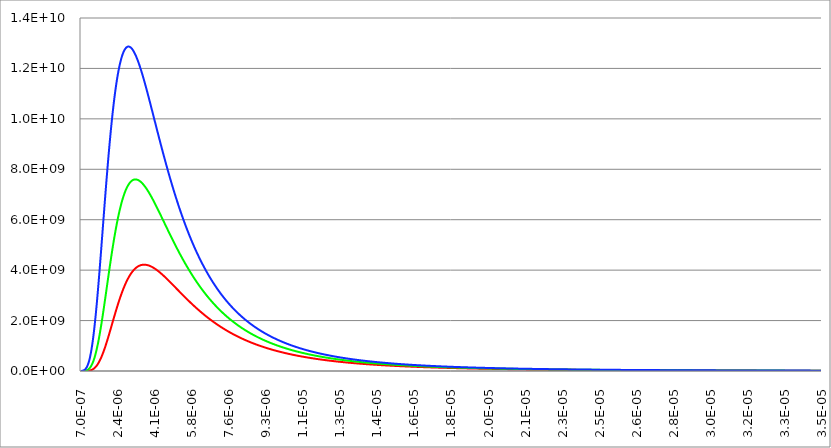
| Category | Series 1 | Series 0 | Series 2 |
|---|---|---|---|
| 7e-07 | 0 | 0 | 0 |
| 7.1715e-07 | 0 | 0 | 0 |
| 7.343e-07 | 0 | 0 | 0 |
| 7.5145e-07 | 63017.05 | 900243.841 | 7555823.94 |
| 7.686e-07 | 96024.858 | 1292754.587 | 10347180.398 |
| 7.8575e-07 | 143306.693 | 1822863.408 | 13942615.577 |
| 8.029e-07 | 209753.17 | 2526994.244 | 18506352.669 |
| 8.2005e-07 | 301481.452 | 3447872.196 | 24220528.497 |
| 8.372e-07 | 426017.487 | 4634884.951 | 31284426.29 |
| 8.5435e-07 | 592478.291 | 6144340.909 | 39913297.495 |
| 8.715e-07 | 811749.177 | 8039610.81 | 50336797.511 |
| 8.8865e-07 | 1096650.66 | 10391143.431 | 62797072.3 |
| 9.058e-07 | 1462089.82 | 13276349.92 | 77546542.491 |
| 9.2295e-07 | 1925191.194 | 16779355.419 | 94845438.836 |
| 9.401e-07 | 2505402.696 | 20990620.53 | 114959147.531 |
| 9.5725e-07 | 3224572.686 | 26006438.843 | 138155426.205 |
| 9.744e-07 | 4106995.03 | 31928319.904 | 164701551.366 |
| 9.9155e-07 | 5179419.822 | 38862269.762 | 194861456.194 |
| 1.0087e-06 | 6471028.296 | 46917983.332 | 228892914.036 |
| 1.02585e-06 | 8013371.355 | 56207964.396 | 267044818.077 |
| 1.043e-06 | 9840271.99 | 66846590.043 | 309554601.908 |
| 1.06015e-06 | 11987692.704 | 78949136.797 | 356645839.274 |
| 1.0773e-06 | 14493569.766 | 92630785.612 | 408526054.532 |
| 1.09445e-06 | 17397616.829 | 108005622.42 | 465384768.516 |
| 1.1116e-06 | 20741100.956 | 125185650.035 | 527391797.814 |
| 1.12875e-06 | 24566594.572 | 144279826.03 | 594695819.073 |
| 1.1459e-06 | 28917707.189 | 165393139.801 | 667423204.035 |
| 1.16305e-06 | 33838800.967 | 188625740.432 | 745677125.626 |
| 1.1802e-06 | 39374694.312 | 214072125.289 | 829536930.651 |
| 1.19735e-06 | 45570357.705 | 241820397.539 | 919057770.544 |
| 1.2145e-06 | 52470605.904 | 271951599.054 | 1014270478.177 |
| 1.23165e-06 | 60119790.506 | 304539123.463 | 1115181675.9 |
| 1.2488e-06 | 68561496.639 | 339648212.51 | 1221774097.835 |
| 1.26595e-06 | 77838247.287 | 377335537.381 | 1334007107.808 |
| 1.2831e-06 | 87991218.422 | 417648865.242 | 1451817393.254 |
| 1.30025e-06 | 99059967.814 | 460626810.057 | 1575119814.817 |
| 1.3174e-06 | 111082179.963 | 506298665.597 | 1703808391.199 |
| 1.33455e-06 | 124093429.281 | 554684317.638 | 1837757399.005 |
| 1.3517e-06 | 138126963.239 | 605794231.578 | 1976822567.811 |
| 1.36885e-06 | 153213506.835 | 659629511.006 | 2120842351.433 |
| 1.386e-06 | 169381089.379 | 716182022.288 | 2269639257.343 |
| 1.40315e-06 | 186654894.254 | 775434579.85 | 2423021217.244 |
| 1.4203e-06 | 205057131.971 | 837361186.577 | 2580782983.074 |
| 1.43745e-06 | 224606936.585 | 901927323.591 | 2742707533.966 |
| 1.4546e-06 | 245320285.215 | 969090283.64 | 2908567481.05 |
| 1.47175e-06 | 267209940.225 | 1038799542.339 | 3078126458.323 |
| 1.4889e-06 | 290285413.369 | 1110997161.638 | 3251140489.153 |
| 1.50605e-06 | 314552951.055 | 1185618220.018 | 3427359319.292 |
| 1.5232e-06 | 340015539.716 | 1262591264.186 | 3606527708.549 |
| 1.54035e-06 | 366672930.136 | 1341838777.256 | 3788386674.466 |
| 1.5575e-06 | 394521679.518 | 1423277658.72 | 3972674682.494 |
| 1.57465e-06 | 423555209.966 | 1506819711.821 | 4159128778.225 |
| 1.5918e-06 | 453763882.022 | 1592372134.258 | 4347485658.231 |
| 1.60895e-06 | 485135081.871 | 1679838008.526 | 4537482676.954 |
| 1.6261e-06 | 517653320.795 | 1769116788.489 | 4728858787.931 |
| 1.64325e-06 | 551300345.484 | 1860104779.182 | 4921355418.374 |
| 1.6604e-06 | 586055257.809 | 1952695607.116 | 5114717276.794 |
| 1.67755e-06 | 621894642.714 | 2046780678.735 | 5308693093.936 |
| 1.6947e-06 | 658792702.897 | 2142249624.968 | 5503036297.811 |
| 1.71185e-06 | 696721399.044 | 2238990730.105 | 5697505624.073 |
| 1.729e-06 | 735650594.392 | 2336891343.548 | 5891865663.331 |
| 1.74615e-06 | 775548202.484 | 2435838273.205 | 6085887347.342 |
| 1.7633e-06 | 816380337.061 | 2535718159.604 | 6279348376.276 |
| 1.78045e-06 | 858111463.073 | 2636417829.97 | 6472033589.461 |
| 1.7976e-06 | 900704547.891 | 2737824631.769 | 6663735282.17 |
| 1.81475e-06 | 944121211.869 | 2839826745.393 | 6854253471.166 |
| 1.8319e-06 | 988321877.472 | 2942313475.837 | 7043396111.764 |
| 1.84905e-06 | 1033265916.277 | 3045175523.375 | 7230979269.256 |
| 1.8662e-06 | 1078911793.205 | 3148305233.394 | 7416827247.556 |
| 1.88335e-06 | 1125217207.418 | 3251596825.646 | 7600772677.913 |
| 1.9005e-06 | 1172139229.406 | 3354946603.301 | 7782656570.516 |
| 1.91765e-06 | 1219634433.811 | 3458253142.279 | 7962328331.786 |
| 1.9348e-06 | 1267659027.641 | 3561417461.41 | 8139645750.062 |
| 1.95194999999999e-06 | 1316168973.544 | 3664343174.033 | 8314474952.337 |
| 1.96909999999999e-06 | 1365120107.914 | 3766936621.721 | 8486690334.597 |
| 1.98624999999999e-06 | 1414468253.593 | 3869106990.839 | 8656174468.241 |
| 2.00339999999999e-06 | 1464169327.052 | 3970766412.686 | 8822817984.926 |
| 2.02054999999999e-06 | 1514179439.908 | 4071830048.011 | 8986519442.115 |
| 2.03769999999999e-06 | 1564454994.727 | 4172216156.679 | 9147185171.462 |
| 2.05484999999999e-06 | 1614952775.069 | 4271846153.302 | 9304729112.069 |
| 2.07199999999999e-06 | 1665630029.789 | 4370644649.645 | 9459072630.534 |
| 2.08914999999999e-06 | 1716444551.611 | 4468539484.599 | 9610144329.606 |
| 2.10629999999999e-06 | 1767354750.045 | 4565461742.532 | 9757879847.118 |
| 2.12344999999999e-06 | 1818319718.723 | 4661345760.803 | 9902221646.805 |
| 2.14059999999999e-06 | 1869299297.27 | 4756129127.203 | 10043118802.459 |
| 2.15774999999999e-06 | 1920254127.815 | 4849752668.077 | 10180526776.798 |
| 2.17489999999999e-06 | 1971145706.302 | 4942160427.872 | 10314407196.307 |
| 2.19204999999999e-06 | 2021936428.737 | 5033299640.798 | 10444727623.222 |
| 2.20919999999999e-06 | 2072589632.551 | 5123120695.304 | 10571461325.711 |
| 2.22634999999999e-06 | 2123069633.24 | 5211577092.012 | 10694587047.252 |
| 2.24349999999999e-06 | 2173341756.473 | 5298625395.753 | 10814088776.072 |
| 2.26064999999999e-06 | 2223372365.853 | 5384225182.282 | 10929955515.475 |
| 2.27779999999999e-06 | 2273128886.519 | 5468338980.279 | 11042181055.774 |
| 2.29494999999999e-06 | 2322579824.794 | 5550932209.141 | 11150763748.496 |
| 2.31209999999999e-06 | 2371694784.061 | 5631973113.108 | 11255706283.427 |
| 2.32924999999999e-06 | 2420444477.078 | 5711432692.194 | 11357015469.03 |
| 2.34639999999999e-06 | 2468800734.916 | 5789284630.39 | 11454702016.688 |
| 2.36354999999999e-06 | 2516736512.723 | 5865505221.546 | 11548780329.178 |
| 2.38069999999999e-06 | 2564225892.499 | 5940073293.373 | 11639268293.71 |
| 2.39784999999999e-06 | 2611244083.072 | 6012970129.893 | 11726187079.849 |
| 2.41499999999999e-06 | 2657767417.465 | 6084179392.726 | 11809560942.55 |
| 2.43214999999999e-06 | 2703773347.825 | 6153687041.515 | 11889417030.529 |
| 2.44929999999999e-06 | 2749240438.093 | 6221481253.794 | 11965785200.138 |
| 2.46644999999999e-06 | 2794148354.593 | 6287552344.579 | 12038697834.871 |
| 2.48359999999999e-06 | 2838477854.684 | 6351892685.938 | 12108189670.607 |
| 2.50074999999999e-06 | 2882210773.658 | 6414496626.765 | 12174297626.669 |
| 2.51789999999999e-06 | 2925330010.021 | 6475360412.975 | 12237060642.72 |
| 2.53504999999999e-06 | 2967819509.303 | 6534482108.321 | 12296519521.54 |
| 2.55219999999999e-06 | 3009664246.55 | 6591861515.996 | 12352716777.666 |
| 2.56934999999999e-06 | 3050850207.617 | 6647500101.188 | 12405696491.875 |
| 2.58649999999999e-06 | 3091364369.398 | 6701400914.719 | 12455504171.46 |
| 2.60364999999999e-06 | 3131194679.116 | 6753568517.913 | 12502186616.266 |
| 2.62079999999999e-06 | 3170330032.779 | 6804008908.783 | 12545791790.373 |
| 2.63794999999999e-06 | 3208760252.923 | 6852729449.651 | 12586368699.386 |
| 2.65509999999999e-06 | 3246476065.735 | 6899738796.281 | 12623967273.201 |
| 2.67224999999999e-06 | 3283469077.662 | 6945046828.595 | 12658638254.158 |
| 2.68939999999999e-06 | 3319731751.586 | 6988664583.048 | 12690433090.466 |
| 2.70654999999999e-06 | 3355257382.668 | 7030604186.696 | 12719403834.776 |
| 2.72369999999999e-06 | 3390040073.918 | 7070878793.021 | 12745603047.778 |
| 2.74084999999999e-06 | 3424074711.592 | 7109502519.522 | 12769083706.689 |
| 2.75799999999999e-06 | 3457356940.465 | 7146490387.127 | 12789899118.498 |
| 2.77514999999999e-06 | 3489883139.058 | 7181858261.419 | 12808102837.828 |
| 2.79229999999999e-06 | 3521650394.869 | 7215622795.705 | 12823748589.279 |
| 2.80944999999999e-06 | 3552656479.677 | 7247801375.923 | 12836890194.104 |
| 2.82659999999999e-06 | 3582899824.957 | 7278412067.396 | 12847581501.08 |
| 2.84374999999999e-06 | 3612379497.46 | 7307473563.416 | 12855876321.431 |
| 2.86089999999999e-06 | 3641095175.004 | 7335005135.659 | 12861828367.657 |
| 2.87804999999999e-06 | 3669047122.508 | 7361026586.41 | 12865491196.132 |
| 2.89519999999999e-06 | 3696236168.31 | 7385558202.581 | 12866918153.32 |
| 2.91234999999999e-06 | 3722663680.803 | 7408620711.503 | 12866162325.493 |
| 2.92949999999999e-06 | 3748331545.41 | 7430235238.457 | 12863276491.778 |
| 2.94664999999999e-06 | 3773242141.937 | 7450423265.934 | 12858313080.434 |
| 2.96379999999999e-06 | 3797398322.317 | 7469206594.58 | 12851324128.206 |
| 2.98094999999999e-06 | 3820803388.764 | 7486607305.793 | 12842361242.623 |
| 2.99809999999999e-06 | 3843461072.37 | 7502647725.952 | 12831475567.129 |
| 3.01524999999999e-06 | 3865375512.144 | 7517350392.225 | 12818717748.907 |
| 3.03239999999999e-06 | 3886551234.513 | 7530738019.935 | 12804137909.285 |
| 3.04954999999999e-06 | 3906993133.299 | 7542833471.436 | 12787785616.601 |
| 3.06669999999999e-06 | 3926706450.177 | 7553659726.463 | 12769709861.406 |
| 3.08384999999999e-06 | 3945696755.622 | 7563239853.921 | 12749959033.911 |
| 3.10099999999999e-06 | 3963969930.359 | 7571596985.063 | 12728580903.547 |
| 3.11814999999999e-06 | 3981532147.301 | 7578754288.03 | 12705622600.556 |
| 3.13529999999999e-06 | 3998389854.001 | 7584734943.704 | 12681130599.492 |
| 3.15244999999999e-06 | 4014549755.603 | 7589562122.836 | 12655150704.539 |
| 3.16959999999999e-06 | 4030018798.297 | 7593258964.406 | 12627728036.569 |
| 3.18674999999999e-06 | 4044804153.281 | 7595848555.179 | 12598907021.815 |
| 3.20389999999999e-06 | 4058913201.219 | 7597353910.42 | 12568731382.1 |
| 3.22104999999999e-06 | 4072353517.203 | 7597797955.715 | 12537244126.525 |
| 3.23819999999999e-06 | 4085132856.205 | 7597203509.878 | 12504487544.533 |
| 3.25534999999999e-06 | 4097259139.021 | 7595593268.885 | 12470503200.275 |
| 3.27249999999999e-06 | 4108740438.695 | 7592989790.816 | 12435331928.201 |
| 3.28964999999999e-06 | 4119584967.429 | 7589415481.756 | 12399013829.8 |
| 3.30679999999999e-06 | 4129801063.956 | 7584892582.618 | 12361588271.425 |
| 3.32394999999999e-06 | 4139397181.381 | 7579443156.861 | 12323093883.14 |
| 3.34109999999999e-06 | 4148381875.479 | 7573089079.059 | 12283568558.504 |
| 3.35824999999999e-06 | 4156763793.439 | 7565852024.286 | 12243049455.266 |
| 3.37539999999999e-06 | 4164551663.049 | 7557753458.297 | 12201572996.88 |
| 3.39254999999999e-06 | 4171754282.312 | 7548814628.451 | 12159174874.803 |
| 3.40969999999999e-06 | 4178380509.486 | 7539056555.358 | 12115890051.516 |
| 3.42684999999999e-06 | 4184439253.532 | 7528500025.223 | 12071752764.221 |
| 3.44399999999999e-06 | 4189939464.972 | 7517165582.838 | 12026796529.165 |
| 3.46114999999999e-06 | 4194890127.133 | 7505073525.212 | 11981054146.538 |
| 3.47829999999999e-06 | 4199300247.785 | 7492243895.801 | 11934557705.916 |
| 3.49544999999999e-06 | 4203178851.144 | 7478696479.306 | 11887338592.189 |
| 3.51259999999999e-06 | 4206534970.245 | 7464450797.025 | 11839427491.955 |
| 3.52974999999999e-06 | 4209377639.668 | 7449526102.722 | 11790854400.318 |
| 3.54689999999999e-06 | 4211715888.612 | 7433941378.989 | 11741648628.081 |
| 3.56404999999999e-06 | 4213558734.3 | 7417715334.085 | 11691838809.281 |
| 3.58119999999999e-06 | 4214915175.71 | 7400866399.218 | 11641452909.035 |
| 3.59834999999999e-06 | 4215794187.628 | 7383412726.249 | 11590518231.683 |
| 3.61549999999999e-06 | 4216204714.998 | 7365372185.806 | 11539061429.179 |
| 3.63264999999999e-06 | 4216155667.574 | 7346762365.775 | 11487108509.712 |
| 3.64979999999999e-06 | 4215655914.861 | 7327600570.15 | 11434684846.539 |
| 3.66694999999999e-06 | 4214714281.327 | 7307903818.232 | 11381815186.986 |
| 3.68409999999999e-06 | 4213339541.892 | 7287688844.139 | 11328523661.617 |
| 3.70124999999999e-06 | 4211540417.671 | 7266972096.636 | 11274833793.535 |
| 3.71839999999999e-06 | 4209325571.967 | 7245769739.235 | 11220768507.79 |
| 3.73554999999999e-06 | 4206703606.516 | 7224097650.577 | 11166350140.898 |
| 3.75269999999999e-06 | 4203683057.951 | 7201971425.067 | 11111600450.428 |
| 3.76984999999999e-06 | 4200272394.501 | 7179406373.742 | 11056540624.651 |
| 3.78699999999999e-06 | 4196480012.907 | 7156417525.366 | 11001191292.24 |
| 3.80414999999999e-06 | 4192314235.54 | 7133019627.738 | 10945572531.995 |
| 3.82129999999999e-06 | 4187783307.728 | 7109227149.188 | 10889703882.592 |
| 3.83844999999999e-06 | 4182895395.269 | 7085054280.268 | 10833604352.326 |
| 3.85559999999999e-06 | 4177658582.138 | 7060514935.6 | 10777292428.858 |
| 3.87274999999999e-06 | 4172080868.365 | 7035622755.895 | 10720786088.933 |
| 3.88989999999999e-06 | 4166170168.087 | 7010391110.109 | 10664102808.076 |
| 3.90704999999999e-06 | 4159934307.765 | 6984833097.747 | 10607259570.244 |
| 3.92419999999999e-06 | 4153381024.563 | 6958961551.278 | 10550272877.428 |
| 3.94134999999999e-06 | 4146517964.864 | 6932789038.686 | 10493158759.209 |
| 3.95849999999999e-06 | 4139352682.95 | 6906327866.106 | 10435932782.235 |
| 3.97564999999999e-06 | 4131892639.804 | 6879590080.579 | 10378610059.637 |
| 3.99279999999999e-06 | 4124145202.054 | 6852587472.879 | 10321205260.366 |
| 4.00994999999999e-06 | 4116117641.041 | 6825331580.433 | 10263732618.44 |
| 4.02709999999999e-06 | 4107817132.006 | 6797833690.31 | 10206205942.109 |
| 4.04424999999999e-06 | 4099250753.392 | 6770104842.274 | 10148638622.921 |
| 4.0614e-06 | 4090425486.264 | 6742155831.903 | 10091043644.691 |
| 4.07855e-06 | 4081348213.823 | 6713997213.752 | 10033433592.365 |
| 4.0957e-06 | 4072025721.027 | 6685639304.572 | 9975820660.78 |
| 4.11284999999999e-06 | 4062464694.303 | 6657092186.56 | 9918216663.313 |
| 4.12999999999999e-06 | 4052671721.355 | 6628365710.651 | 9860633040.415 |
| 4.14714999999999e-06 | 4042653291.05 | 6599469499.835 | 9803080868.031 |
| 4.16429999999999e-06 | 4032415793.396 | 6570412952.501 | 9745570865.905 |
| 4.18144999999999e-06 | 4021965519.585 | 6541205245.801 | 9688113405.755 |
| 4.19859999999999e-06 | 4011308662.12 | 6511855339.025 | 9630718519.342 |
| 4.21574999999999e-06 | 4000451315.008 | 6482371976.993 | 9573395906.4 |
| 4.23289999999999e-06 | 3989399474.014 | 6452763693.45 | 9516154942.453 |
| 4.25004999999999e-06 | 3978159036.984 | 6423038814.465 | 9459004686.5 |
| 4.26719999999999e-06 | 3966735804.225 | 6393205461.828 | 9401953888.578 |
| 4.28434999999999e-06 | 3955135478.936 | 6363271556.451 | 9345010997.197 |
| 4.30149999999999e-06 | 3943363667.694 | 6333244821.75 | 9288184166.647 |
| 4.31864999999999e-06 | 3931425880.992 | 6303132787.029 | 9231481264.18 |
| 4.3358e-06 | 3919327533.817 | 6272942790.841 | 9174909877.064 |
| 4.35295e-06 | 3907073946.274 | 6242681984.347 | 9118477319.508 |
| 4.3701e-06 | 3894670344.253 | 6212357334.643 | 9062190639.463 |
| 4.38725e-06 | 3882121860.126 | 6181975628.081 | 9006056625.3 |
| 4.4044e-06 | 3869433533.486 | 6151543473.557 | 8950081812.352 |
| 4.42155e-06 | 3856610311.92 | 6121067305.785 | 8894272489.341 |
| 4.4387e-06 | 3843657051.802 | 6090553388.536 | 8838634704.679 |
| 4.45585e-06 | 3830578519.126 | 6060007817.864 | 8783174272.639 |
| 4.473e-06 | 3817379390.359 | 6029436525.287 | 8727896779.413 |
| 4.49015e-06 | 3804064253.318 | 5998845280.95 | 8672807589.042 |
| 4.5073e-06 | 3790637608.071 | 5968239696.753 | 8617911849.23 |
| 4.52445e-06 | 3777103867.854 | 5937625229.448 | 8563214497.032 |
| 4.5416e-06 | 3763467360.013 | 5907007183.699 | 8508720264.436 |
| 4.55875e-06 | 3749732326.958 | 5876390715.113 | 8454433683.818 |
| 4.5759e-06 | 3735902927.13 | 5845780833.231 | 8400359093.285 |
| 4.59305e-06 | 3721983235.986 | 5815182404.489 | 8346500641.909 |
| 4.6102e-06 | 3707977246.998 | 5784600155.136 | 8292862294.839 |
| 4.62735e-06 | 3693888872.649 | 5754038674.115 | 8239447838.312 |
| 4.6445e-06 | 3679721945.46 | 5723502415.917 | 8186260884.552 |
| 4.66165e-06 | 3665480219.001 | 5692995703.379 | 8133304876.556 |
| 4.6788e-06 | 3651167368.929 | 5662522730.459 | 8080583092.78 |
| 4.69595e-06 | 3636786994.018 | 5632087564.965 | 8028098651.719 |
| 4.7131e-06 | 3622342617.202 | 5601694151.245 | 7975854516.383 |
| 4.73025e-06 | 3607837686.612 | 5571346312.835 | 7923853498.671 |
| 4.7474e-06 | 3593275576.628 | 5541047755.077 | 7872098263.647 |
| 4.76455e-06 | 3578659588.919 | 5510802067.685 | 7820591333.721 |
| 4.7817e-06 | 3563992953.493 | 5480612727.28 | 7769335092.722 |
| 4.79885e-06 | 3549278829.745 | 5450483099.88 | 7718331789.893 |
| 4.816e-06 | 3534520307.499 | 5420416443.355 | 7667583543.778 |
| 4.83315000000001e-06 | 3519720408.054 | 5390415909.835 | 7617092346.025 |
| 4.85030000000001e-06 | 3504882085.225 | 5360484548.085 | 7566860065.099 |
| 4.86745000000001e-06 | 3490008226.379 | 5330625305.839 | 7516888449.905 |
| 4.88460000000001e-06 | 3475101653.47 | 5300841032.092 | 7467179133.324 |
| 4.90175000000001e-06 | 3460165124.071 | 5271134479.353 | 7417733635.666 |
| 4.91890000000001e-06 | 3445201332.394 | 5241508305.861 | 7368553368.038 |
| 4.93605000000001e-06 | 3430212910.31 | 5211965077.763 | 7319639635.631 |
| 4.95320000000001e-06 | 3415202428.366 | 5182507271.249 | 7270993640.929 |
| 4.97035000000001e-06 | 3400172396.786 | 5153137274.653 | 7222616486.83 |
| 4.98750000000001e-06 | 3385125266.472 | 5123857390.514 | 7174509179.708 |
| 5.00465000000001e-06 | 3370063429.998 | 5094669837.598 | 7126672632.378 |
| 5.02180000000001e-06 | 3354989222.592 | 5065576752.887 | 7079107667.005 |
| 5.03895000000001e-06 | 3339904923.116 | 5036580193.528 | 7031815017.93 |
| 5.05610000000001e-06 | 3324812755.028 | 5007682138.742 | 6984795334.43 |
| 5.07325000000001e-06 | 3309714887.346 | 4978884491.706 | 6938049183.404 |
| 5.09040000000001e-06 | 3294613435.599 | 4950189081.389 | 6891577051.997 |
| 5.10755000000001e-06 | 3279510462.763 | 4921597664.361 | 6845379350.153 |
| 5.12470000000001e-06 | 3264407980.199 | 4893111926.559 | 6799456413.105 |
| 5.14185000000001e-06 | 3249307948.571 | 4864733485.027 | 6753808503.798 |
| 5.15900000000001e-06 | 3234212278.76 | 4836463889.613 | 6708435815.255 |
| 5.17615000000001e-06 | 3219122832.766 | 4808304624.64 | 6663338472.878 |
| 5.19330000000001e-06 | 3204041424.6 | 4780257110.538 | 6618516536.69 |
| 5.21045000000001e-06 | 3188969821.167 | 4752322705.45 | 6573970003.521 |
| 5.22760000000001e-06 | 3173909743.136 | 4724502706.793 | 6529698809.13 |
| 5.24475000000001e-06 | 3158862865.803 | 4696798352.802 | 6485702830.283 |
| 5.26190000000001e-06 | 3143830819.939 | 4669210824.034 | 6441981886.766 |
| 5.27905000000001e-06 | 3128815192.632 | 4641741244.842 | 6398535743.349 |
| 5.29620000000001e-06 | 3113817528.114 | 4614390684.819 | 6355364111.697 |
| 5.31335000000001e-06 | 3098839328.58 | 4587160160.21 | 6312466652.233 |
| 5.33050000000001e-06 | 3083882054.998 | 4560050635.303 | 6269842975.944 |
| 5.34765000000001e-06 | 3068947127.901 | 4533063023.776 | 6227492646.151 |
| 5.36480000000001e-06 | 3054035928.175 | 4506198190.028 | 6185415180.216 |
| 5.38195000000002e-06 | 3039149797.832 | 4479456950.479 | 6143610051.214 |
| 5.39910000000002e-06 | 3024290040.778 | 4452840074.834 | 6102076689.56 |
| 5.41625000000002e-06 | 3009457923.559 | 4426348287.334 | 6060814484.582 |
| 5.43340000000002e-06 | 2994654676.11 | 4399982267.967 | 6019822786.059 |
| 5.45055000000002e-06 | 2979881492.481 | 4373742653.658 | 5979100905.719 |
| 5.46770000000002e-06 | 2965139531.559 | 4347630039.436 | 5938648118.687 |
| 5.48485000000002e-06 | 2950429917.777 | 4321644979.572 | 5898463664.9 |
| 5.50200000000002e-06 | 2935753741.814 | 4295787988.689 | 5858546750.482 |
| 5.51915000000002e-06 | 2921112061.281 | 4270059542.854 | 5818896549.076 |
| 5.53630000000002e-06 | 2906505901.399 | 4244460080.643 | 5779512203.147 |
| 5.55345000000002e-06 | 2891936255.665 | 4218990004.179 | 5740392825.239 |
| 5.57060000000002e-06 | 2877404086.509 | 4193649680.153 | 5701537499.205 |
| 5.58775000000002e-06 | 2862910325.939 | 4168439440.816 | 5662945281.398 |
| 5.60490000000002e-06 | 2848455876.178 | 4143359584.954 | 5624615201.83 |
| 5.62205000000002e-06 | 2834041610.285 | 4118410378.837 | 5586546265.294 |
| 5.63920000000002e-06 | 2819668372.773 | 4093592057.146 | 5548737452.46 |
| 5.65635000000002e-06 | 2805336980.211 | 4068904823.883 | 5511187720.937 |
| 5.67350000000002e-06 | 2791048221.823 | 4044348853.259 | 5473896006.305 |
| 5.69065000000002e-06 | 2776802860.065 | 4019924290.557 | 5436861223.111 |
| 5.70780000000002e-06 | 2762601631.207 | 3995631252.978 | 5400082265.85 |
| 5.72495000000002e-06 | 2748445245.893 | 3971469830.472 | 5363558009.903 |
| 5.74210000000002e-06 | 2734334389.697 | 3947440086.542 | 5327287312.457 |
| 5.75925000000002e-06 | 2720269723.67 | 3923542059.036 | 5291269013.392 |
| 5.77640000000002e-06 | 2706251884.874 | 3899775760.911 | 5255501936.148 |
| 5.79355000000002e-06 | 2692281486.912 | 3876141180.993 | 5219984888.56 |
| 5.81070000000002e-06 | 2678359120.44 | 3852638284.706 | 5184716663.676 |
| 5.82785000000002e-06 | 2664485353.68 | 3829267014.791 | 5149696040.541 |
| 5.84500000000002e-06 | 2650660732.916 | 3806027292.006 | 5114921784.964 |
| 5.86215000000002e-06 | 2636885782.987 | 3782919015.808 | 5080392650.263 |
| 5.87930000000002e-06 | 2623161007.766 | 3759942065.024 | 5046107377.981 |
| 5.89645000000003e-06 | 2609486890.633 | 3737096298.496 | 5012064698.59 |
| 5.91360000000003e-06 | 2595863894.939 | 3714381555.722 | 4978263332.16 |
| 5.93075000000003e-06 | 2582292464.465 | 3691797657.473 | 4944701989.025 |
| 5.94790000000003e-06 | 2568773023.861 | 3669344406.398 | 4911379370.41 |
| 5.96505000000003e-06 | 2555305979.094 | 3647021587.616 | 4878294169.053 |
| 5.98220000000003e-06 | 2541891717.872 | 3624828969.29 | 4845445069.802 |
| 5.99935000000003e-06 | 2528530610.071 | 3602766303.192 | 4812830750.193 |
| 6.01650000000003e-06 | 2515223008.147 | 3580833325.246 | 4780449881.009 |
| 6.03365000000003e-06 | 2501969247.542 | 3559029756.068 | 4748301126.826 |
| 6.05080000000003e-06 | 2488769647.088 | 3537355301.484 | 4716383146.537 |
| 6.06795000000003e-06 | 2475624509.392 | 3515809653.039 | 4684694593.862 |
| 6.08510000000003e-06 | 2462534121.225 | 3494392488.495 | 4653234117.84 |
| 6.10225000000003e-06 | 2449498753.897 | 3473103472.31 | 4622000363.308 |
| 6.11940000000003e-06 | 2436518663.627 | 3451942256.114 | 4590991971.359 |
| 6.13655000000003e-06 | 2423594091.902 | 3430908479.167 | 4560207579.793 |
| 6.15370000000003e-06 | 2410725265.838 | 3410001768.806 | 4529645823.546 |
| 6.17085000000003e-06 | 2397912398.524 | 3389221740.881 | 4499305335.109 |
| 6.18800000000003e-06 | 2385155689.363 | 3368568000.184 | 4469184744.93 |
| 6.20515000000003e-06 | 2372455324.411 | 3348040140.861 | 4439282681.808 |
| 6.22230000000003e-06 | 2359811476.701 | 3327637746.816 | 4409597773.269 |
| 6.23945000000003e-06 | 2347224306.565 | 3307360392.106 | 4380128645.928 |
| 6.25660000000003e-06 | 2334693961.953 | 3287207641.326 | 4350873925.847 |
| 6.27375000000003e-06 | 2322220578.737 | 3267179049.978 | 4321832238.868 |
| 6.29090000000003e-06 | 2309804281.015 | 3247274164.841 | 4293002210.95 |
| 6.30805000000003e-06 | 2297445181.412 | 3227492524.323 | 4264382468.478 |
| 6.32520000000003e-06 | 2285143381.365 | 3207833658.805 | 4235971638.576 |
| 6.34235000000003e-06 | 2272898971.409 | 3188297090.979 | 4207768349.397 |
| 6.35950000000003e-06 | 2260712031.459 | 3168882336.177 | 4179771230.411 |
| 6.37665000000003e-06 | 2248582631.079 | 3149588902.688 | 4151978912.679 |
| 6.39380000000004e-06 | 2236510829.755 | 3130416292.07 | 4124390029.119 |
| 6.41095000000004e-06 | 2224496677.152 | 3111363999.449 | 4097003214.757 |
| 6.42810000000004e-06 | 2212540213.372 | 3092431513.817 | 4069817106.979 |
| 6.44525000000004e-06 | 2200641469.209 | 3073618318.319 | 4042830345.763 |
| 6.46240000000004e-06 | 2188800466.39 | 3054923890.528 | 4016041573.908 |
| 6.47955000000004e-06 | 2177017217.823 | 3036347702.719 | 3989449437.254 |
| 6.49670000000004e-06 | 2165291727.824 | 3017889222.131 | 3963052584.894 |
| 6.51385000000004e-06 | 2153623992.356 | 2999547911.227 | 3936849669.375 |
| 6.53100000000004e-06 | 2142013999.253 | 2981323227.94 | 3910839346.893 |
| 6.54815000000004e-06 | 2130461728.44 | 2963214625.918 | 3885020277.482 |
| 6.56530000000004e-06 | 2118967152.152 | 2945221554.761 | 3859391125.194 |
| 6.58245000000004e-06 | 2107530235.144 | 2927343460.249 | 3833950558.267 |
| 6.59960000000004e-06 | 2096150934.902 | 2909579784.565 | 3808697249.299 |
| 6.61675000000004e-06 | 2084829201.843 | 2891929966.516 | 3783629875.4 |
| 6.63390000000004e-06 | 2073564979.518 | 2874393441.74 | 3758747118.347 |
| 6.65105000000004e-06 | 2062358204.8 | 2856969642.912 | 3734047664.73 |
| 6.66820000000004e-06 | 2051208808.085 | 2839657999.947 | 3709530206.09 |
| 6.68535000000004e-06 | 2040116713.466 | 2822457940.188 | 3685193439.056 |
| 6.70250000000004e-06 | 2029081838.928 | 2805368888.599 | 3661036065.469 |
| 6.71965000000004e-06 | 2018104096.515 | 2788390267.947 | 3637056792.505 |
| 6.73680000000004e-06 | 2007183392.514 | 2771521498.978 | 3613254332.792 |
| 6.75395000000004e-06 | 1996319627.621 | 2754762000.591 | 3589627404.524 |
| 6.77110000000004e-06 | 1985512697.106 | 2738111190.005 | 3566174731.56 |
| 6.78825000000004e-06 | 1974762490.983 | 2721568482.923 | 3542895043.532 |
| 6.80540000000004e-06 | 1964068894.163 | 2705133293.688 | 3519787075.936 |
| 6.82255000000004e-06 | 1953431786.617 | 2688805035.437 | 3496849570.226 |
| 6.83970000000004e-06 | 1942851043.522 | 2672583120.251 | 3474081273.899 |
| 6.85685000000004e-06 | 1932326535.414 | 2656466959.298 | 3451480940.577 |
| 6.87400000000004e-06 | 1921858128.335 | 2640455962.974 | 3429047330.087 |
| 6.89115000000004e-06 | 1911445683.974 | 2624549541.036 | 3406779208.532 |
| 6.90830000000004e-06 | 1901089059.807 | 2608747102.74 | 3384675348.362 |
| 6.92545000000004e-06 | 1890788109.233 | 2593048056.962 | 3362734528.438 |
| 6.94260000000005e-06 | 1880542681.71 | 2577451812.324 | 3340955534.096 |
| 6.95975000000005e-06 | 1870352622.882 | 2561957777.318 | 3319337157.202 |
| 6.97690000000005e-06 | 1860217774.709 | 2546565360.416 | 3297878196.21 |
| 6.99405000000005e-06 | 1850137975.59 | 2531273970.188 | 3276577456.209 |
| 7.01120000000005e-06 | 1840113060.486 | 2516083015.406 | 3255433748.973 |
| 7.02835000000005e-06 | 1830142861.037 | 2500991905.155 | 3234445893.005 |
| 7.04550000000005e-06 | 1820227205.681 | 2486000048.932 | 3213612713.577 |
| 7.06265000000005e-06 | 1810365919.766 | 2471106856.747 | 3192933042.768 |
| 7.07980000000005e-06 | 1800558825.66 | 2456311739.216 | 3172405719.502 |
| 7.09695000000005e-06 | 1790805742.861 | 2441614107.658 | 3152029589.577 |
| 7.11410000000005e-06 | 1781106488.103 | 2427013374.182 | 3131803505.692 |
| 7.13125000000005e-06 | 1771460875.457 | 2412508951.772 | 3111726327.482 |
| 7.14840000000005e-06 | 1761868716.435 | 2398100254.375 | 3091796921.533 |
| 7.16555000000005e-06 | 1752329820.087 | 2383786696.981 | 3072014161.408 |
| 7.18270000000005e-06 | 1742843993.098 | 2369567695.699 | 3052376927.668 |
| 7.19985000000005e-06 | 1733411039.88 | 2355442667.835 | 3032884107.884 |
| 7.21700000000005e-06 | 1724030762.667 | 2341411031.965 | 3013534596.654 |
| 7.23415000000005e-06 | 1714702961.603 | 2327472208.003 | 2994327295.615 |
| 7.25130000000005e-06 | 1705427434.828 | 2313625617.274 | 2975261113.455 |
| 7.26845000000005e-06 | 1696203978.566 | 2299870682.574 | 2956334965.916 |
| 7.28560000000005e-06 | 1687032387.208 | 2286206828.236 | 2937547775.807 |
| 7.30275000000005e-06 | 1677912453.392 | 2272633480.194 | 2918898473 |
| 7.31990000000005e-06 | 1668843968.082 | 2259150066.037 | 2900385994.442 |
| 7.33705000000005e-06 | 1659826720.647 | 2245756015.066 | 2882009284.146 |
| 7.35420000000005e-06 | 1650860498.937 | 2232450758.353 | 2863767293.197 |
| 7.37135000000005e-06 | 1641945089.356 | 2219233728.788 | 2845658979.744 |
| 7.38850000000005e-06 | 1633080276.932 | 2206104361.135 | 2827683308.999 |
| 7.40565000000005e-06 | 1624265845.389 | 2193062092.074 | 2809839253.231 |
| 7.42280000000005e-06 | 1615501577.219 | 2180106360.256 | 2792125791.754 |
| 7.43995000000006e-06 | 1606787253.74 | 2167236606.338 | 2774541910.925 |
| 7.45710000000006e-06 | 1598122655.169 | 2154452273.034 | 2757086604.128 |
| 7.47425000000006e-06 | 1589507560.683 | 2141752805.153 | 2739758871.763 |
| 7.49140000000006e-06 | 1580941748.48 | 2129137649.638 | 2722557721.236 |
| 7.50855000000006e-06 | 1572424995.838 | 2116606255.606 | 2705482166.945 |
| 7.52570000000006e-06 | 1563957079.179 | 2104158074.383 | 2688531230.258 |
| 7.54285000000006e-06 | 1555537774.12 | 2091792559.536 | 2671703939.505 |
| 7.56000000000006e-06 | 1547166855.535 | 2079509166.912 | 2654999329.955 |
| 7.57715000000006e-06 | 1538844097.602 | 2067307354.666 | 2638416443.798 |
| 7.59430000000006e-06 | 1530569273.865 | 2055186583.291 | 2621954330.129 |
| 7.61145000000006e-06 | 1522342157.276 | 2043146315.647 | 2605612044.921 |
| 7.62860000000006e-06 | 1514162520.256 | 2031186016.99 | 2589388651.01 |
| 7.64575000000006e-06 | 1506030134.732 | 2019305154.998 | 2573283218.065 |
| 7.66290000000006e-06 | 1497944772.196 | 2007503199.794 | 2557294822.574 |
| 7.68005000000006e-06 | 1489906203.745 | 1995779623.971 | 2541422547.81 |
| 7.69720000000006e-06 | 1481914200.126 | 1984133902.612 | 2525665483.813 |
| 7.71435000000006e-06 | 1473968531.784 | 1972565513.316 | 2510022727.362 |
| 7.73150000000006e-06 | 1466068968.901 | 1961073936.214 | 2494493381.947 |
| 7.74865000000006e-06 | 1458215281.442 | 1949658653.988 | 2479076557.744 |
| 7.76580000000006e-06 | 1450407239.19 | 1938319151.892 | 2463771371.587 |
| 7.78295000000006e-06 | 1442644611.791 | 1927054917.763 | 2448576946.938 |
| 7.80010000000006e-06 | 1434927168.787 | 1915865442.044 | 2433492413.858 |
| 7.81725000000006e-06 | 1427254679.661 | 1904750217.792 | 2418516908.979 |
| 7.83440000000006e-06 | 1419626913.864 | 1893708740.695 | 2403649575.473 |
| 7.85155000000006e-06 | 1412043640.858 | 1882740509.086 | 2388889563.021 |
| 7.86870000000006e-06 | 1404504630.146 | 1871845023.95 | 2374236027.783 |
| 7.88585000000006e-06 | 1397009651.308 | 1861021788.942 | 2359688132.363 |
| 7.90300000000006e-06 | 1389558474.033 | 1850270310.389 | 2345245045.78 |
| 7.92015000000006e-06 | 1382150868.147 | 1839590097.307 | 2330905943.437 |
| 7.93730000000006e-06 | 1374786603.65 | 1828980661.403 | 2316670007.082 |
| 7.95445000000006e-06 | 1367465450.74 | 1818441517.087 | 2302536424.782 |
| 7.97160000000006e-06 | 1360187179.845 | 1807972181.476 | 2288504390.882 |
| 7.98875000000007e-06 | 1352951561.651 | 1797572174.404 | 2274573105.977 |
| 8.00590000000007e-06 | 1345758367.128 | 1787241018.421 | 2260741776.875 |
| 8.02305000000007e-06 | 1338607367.558 | 1776978238.805 | 2247009616.563 |
| 8.04020000000007e-06 | 1331498334.558 | 1766783363.559 | 2233375844.171 |
| 8.05735000000007e-06 | 1324431040.108 | 1756655923.421 | 2219839684.939 |
| 8.07450000000007e-06 | 1317405256.573 | 1746595451.861 | 2206400370.178 |
| 8.09165000000007e-06 | 1310420756.729 | 1736601485.087 | 2193057137.239 |
| 8.10880000000007e-06 | 1303477313.782 | 1726673562.044 | 2179809229.474 |
| 8.12595000000007e-06 | 1296574701.392 | 1716811224.417 | 2166655896.201 |
| 8.14310000000007e-06 | 1289712693.696 | 1707014016.63 | 2153596392.668 |
| 8.16025000000007e-06 | 1282891065.327 | 1697281485.845 | 2140629980.016 |
| 8.17740000000007e-06 | 1276109591.431 | 1687613181.962 | 2127755925.242 |
| 8.19455000000007e-06 | 1269368047.692 | 1678008657.621 | 2114973501.166 |
| 8.21170000000007e-06 | 1262666210.347 | 1668467468.194 | 2102281986.388 |
| 8.22885000000007e-06 | 1256003856.207 | 1658989171.787 | 2089680665.257 |
| 8.24600000000007e-06 | 1249380762.67 | 1649573329.236 | 2077168827.832 |
| 8.26315000000007e-06 | 1242796707.743 | 1640219504.105 | 2064745769.844 |
| 8.28030000000007e-06 | 1236251470.055 | 1630927262.681 | 2052410792.659 |
| 8.29745000000007e-06 | 1229744828.873 | 1621696173.971 | 2040163203.243 |
| 8.31460000000007e-06 | 1223276564.122 | 1612525809.696 | 2028002314.123 |
| 8.33175000000007e-06 | 1216846456.391 | 1603415744.288 | 2015927443.35 |
| 8.34890000000007e-06 | 1210454286.957 | 1594365554.883 | 2003937914.462 |
| 8.36605000000007e-06 | 1204099837.79 | 1585374821.319 | 1992033056.448 |
| 8.38320000000007e-06 | 1197782891.574 | 1576443126.125 | 1980212203.708 |
| 8.40035000000007e-06 | 1191503231.712 | 1567570054.52 | 1968474696.017 |
| 8.41750000000007e-06 | 1185260642.346 | 1558755194.401 | 1956819878.491 |
| 8.43465000000007e-06 | 1179054908.365 | 1549998136.34 | 1945247101.543 |
| 8.45180000000007e-06 | 1172885815.413 | 1541298473.576 | 1933755720.853 |
| 8.46895000000007e-06 | 1166753149.908 | 1532655802.007 | 1922345097.325 |
| 8.48610000000007e-06 | 1160656699.046 | 1524069720.183 | 1911014597.056 |
| 8.50325000000008e-06 | 1154596250.813 | 1515539829.296 | 1899763591.293 |
| 8.52040000000008e-06 | 1148571593.996 | 1507065733.174 | 1888591456.398 |
| 8.53755000000008e-06 | 1142582518.192 | 1498647038.27 | 1877497573.814 |
| 8.55470000000008e-06 | 1136628813.813 | 1490283353.658 | 1866481330.025 |
| 8.57185000000008e-06 | 1130710272.102 | 1481974291.016 | 1855542116.519 |
| 8.58900000000008e-06 | 1124826685.134 | 1473719464.626 | 1844679329.755 |
| 8.60615000000008e-06 | 1118977845.829 | 1465518491.355 | 1833892371.122 |
| 8.62330000000008e-06 | 1113163547.955 | 1457370990.653 | 1823180646.905 |
| 8.64045000000008e-06 | 1107383586.14 | 1449276584.54 | 1812543568.25 |
| 8.65760000000008e-06 | 1101637755.874 | 1441234897.596 | 1801980551.124 |
| 8.67475000000008e-06 | 1095925853.52 | 1433245556.95 | 1791491016.281 |
| 8.69190000000008e-06 | 1090247676.317 | 1425308192.271 | 1781074389.227 |
| 8.70905000000008e-06 | 1084603022.385 | 1417422435.756 | 1770730100.184 |
| 8.72620000000008e-06 | 1078991690.736 | 1409587922.122 | 1760457584.05 |
| 8.74335000000008e-06 | 1073413481.273 | 1401804288.59 | 1750256280.371 |
| 8.76050000000008e-06 | 1067868194.798 | 1394071174.879 | 1740125633.298 |
| 8.77765000000008e-06 | 1062355633.017 | 1386388223.194 | 1730065091.557 |
| 8.79480000000008e-06 | 1056875598.544 | 1378755078.209 | 1720074108.411 |
| 8.81195000000008e-06 | 1051427894.904 | 1371171387.065 | 1710152141.626 |
| 8.82910000000008e-06 | 1046012326.537 | 1363636799.349 | 1700298653.437 |
| 8.84625000000008e-06 | 1040628698.806 | 1356150967.091 | 1690513110.511 |
| 8.86340000000008e-06 | 1035276817.992 | 1348713544.743 | 1680794983.913 |
| 8.88055000000008e-06 | 1029956491.307 | 1341324189.177 | 1671143749.076 |
| 8.89770000000008e-06 | 1024667526.888 | 1333982559.664 | 1661558885.759 |
| 8.91485000000008e-06 | 1019409733.807 | 1326688317.867 | 1652039878.019 |
| 8.93200000000008e-06 | 1014182922.067 | 1319441127.828 | 1642586214.175 |
| 8.94915000000008e-06 | 1008986902.61 | 1312240655.956 | 1633197386.776 |
| 8.96630000000008e-06 | 1003821487.315 | 1305086571.014 | 1623872892.563 |
| 8.98345000000008e-06 | 998686489.002 | 1297978544.104 | 1614612232.441 |
| 9.00060000000008e-06 | 993581721.434 | 1290916248.66 | 1605414911.444 |
| 9.01775000000008e-06 | 988506999.316 | 1283899360.432 | 1596280438.698 |
| 9.03490000000009e-06 | 983462138.299 | 1276927557.474 | 1587208327.395 |
| 9.05205000000009e-06 | 978446954.978 | 1270000520.13 | 1578198094.756 |
| 9.06920000000009e-06 | 973461266.898 | 1263117931.026 | 1569249262 |
| 9.08635000000009e-06 | 968504892.549 | 1256279475.051 | 1560361354.31 |
| 9.10350000000009e-06 | 963577651.37 | 1249484839.347 | 1551533900.804 |
| 9.12065000000009e-06 | 958679363.749 | 1242733713.3 | 1542766434.5 |
| 9.13780000000009e-06 | 953809851.023 | 1236025788.519 | 1534058492.286 |
| 9.15495000000009e-06 | 948968935.477 | 1229360758.831 | 1525409614.89 |
| 9.17210000000009e-06 | 944156440.345 | 1222738320.263 | 1516819346.845 |
| 9.18925000000009e-06 | 939372189.811 | 1216158171.032 | 1508287236.46 |
| 9.20640000000009e-06 | 934616009.006 | 1209620011.531 | 1499812835.789 |
| 9.22355000000009e-06 | 929887724.011 | 1203123544.314 | 1491395700.602 |
| 9.24070000000009e-06 | 925187161.851 | 1196668474.088 | 1483035390.349 |
| 9.2578500000001e-06 | 920514150.501 | 1190254507.694 | 1474731468.138 |
| 9.2750000000001e-06 | 915868518.88 | 1183881354.101 | 1466483500.696 |
| 9.2921500000001e-06 | 911250096.851 | 1177548724.384 | 1458291058.347 |
| 9.3093000000001e-06 | 906658715.223 | 1171256331.721 | 1450153714.975 |
| 9.3264500000001e-06 | 902094205.745 | 1165003891.372 | 1442071048.001 |
| 9.3436000000001e-06 | 897556401.11 | 1158791120.671 | 1434042638.351 |
| 9.3607500000001e-06 | 893045134.947 | 1152617739.009 | 1426068070.423 |
| 9.37790000000009e-06 | 888560241.826 | 1146483467.826 | 1418146932.066 |
| 9.3950500000001e-06 | 884101557.252 | 1140388030.593 | 1410278814.545 |
| 9.41220000000009e-06 | 879668917.666 | 1134331152.802 | 1402463312.513 |
| 9.42935000000009e-06 | 875262160.441 | 1128312561.953 | 1394700023.988 |
| 9.44650000000009e-06 | 870881123.881 | 1122331987.541 | 1386988550.317 |
| 9.46365000000009e-06 | 866525647.219 | 1116389161.041 | 1379328496.155 |
| 9.48080000000009e-06 | 862195570.615 | 1110483815.897 | 1371719469.434 |
| 9.49795000000009e-06 | 857890735.153 | 1104615687.51 | 1364161081.333 |
| 9.51510000000009e-06 | 853610982.841 | 1098784513.223 | 1356652946.257 |
| 9.5322500000001e-06 | 849356156.606 | 1092990032.311 | 1349194681.804 |
| 9.5494000000001e-06 | 845126100.291 | 1087231985.965 | 1341785908.743 |
| 9.5665500000001e-06 | 840920658.657 | 1081510117.282 | 1334426250.982 |
| 9.5837000000001e-06 | 836739677.376 | 1075824171.25 | 1327115335.545 |
| 9.6008500000001e-06 | 832583003.029 | 1070173894.737 | 1319852792.546 |
| 9.6180000000001e-06 | 828450483.106 | 1064559036.478 | 1312638255.161 |
| 9.6351500000001e-06 | 824341965.999 | 1058979347.062 | 1305471359.602 |
| 9.6523000000001e-06 | 820257301.004 | 1053434578.921 | 1298351745.092 |
| 9.6694500000001e-06 | 816196338.314 | 1047924486.315 | 1291279053.841 |
| 9.6866000000001e-06 | 812158929.019 | 1042448825.321 | 1284252931.018 |
| 9.7037500000001e-06 | 808144925.099 | 1037007353.82 | 1277273024.726 |
| 9.7209000000001e-06 | 804154179.428 | 1031599831.486 | 1270338985.98 |
| 9.7380500000001e-06 | 800186545.761 | 1026226019.772 | 1263450468.679 |
| 9.7552000000001e-06 | 796241878.74 | 1020885681.898 | 1256607129.581 |
| 9.7723500000001e-06 | 792320033.887 | 1015578582.84 | 1249808628.284 |
| 9.7895000000001e-06 | 788420867.6 | 1010304489.316 | 1243054627.194 |
| 9.8066500000001e-06 | 784544237.149 | 1005063169.776 | 1236344791.507 |
| 9.8238000000001e-06 | 780690000.677 | 999854394.387 | 1229678789.184 |
| 9.8409500000001e-06 | 776858017.191 | 994677935.024 | 1223056290.924 |
| 9.8581000000001e-06 | 773048146.564 | 989533565.255 | 1216476970.144 |
| 9.8752500000001e-06 | 769260249.527 | 984421060.333 | 1209940502.955 |
| 9.8924000000001e-06 | 765494187.668 | 979340197.18 | 1203446568.139 |
| 9.9095500000001e-06 | 761749823.428 | 974290754.377 | 1196994847.125 |
| 9.9267000000001e-06 | 758027020.096 | 969272512.152 | 1190585023.968 |
| 9.9438500000001e-06 | 754325641.809 | 964285252.37 | 1184216785.325 |
| 9.9610000000001e-06 | 750645553.544 | 959328758.517 | 1177889820.432 |
| 9.9781500000001e-06 | 746986621.118 | 954402815.694 | 1171603821.085 |
| 9.9953000000001e-06 | 743348711.181 | 949507210.6 | 1165358481.614 |
| 1.00124500000001e-05 | 739731691.215 | 944641731.525 | 1159153498.865 |
| 1.00296000000001e-05 | 736135429.529 | 939806168.335 | 1152988572.176 |
| 1.00467500000001e-05 | 732559795.255 | 935000312.462 | 1146863403.356 |
| 1.00639000000001e-05 | 729004658.347 | 930223956.895 | 1140777696.663 |
| 1.00810500000001e-05 | 725469889.572 | 925476896.164 | 1134731158.785 |
| 1.00982000000001e-05 | 721955360.51 | 920758926.332 | 1128723498.817 |
| 1.01153500000001e-05 | 718460943.551 | 916069844.985 | 1122754428.242 |
| 1.01325000000001e-05 | 714986511.887 | 911409451.216 | 1116823660.908 |
| 1.01496500000001e-05 | 711531939.511 | 906777545.619 | 1110930913.01 |
| 1.01668000000001e-05 | 708097101.215 | 902173930.275 | 1105075903.069 |
| 1.01839500000001e-05 | 704681872.581 | 897598408.743 | 1099258351.912 |
| 1.02011000000001e-05 | 701286129.98 | 893050786.048 | 1093477982.65 |
| 1.02182500000001e-05 | 697909750.571 | 888530868.67 | 1087734520.663 |
| 1.02354000000001e-05 | 694552612.29 | 884038464.534 | 1082027693.574 |
| 1.02525500000001e-05 | 691214593.852 | 879573382.999 | 1076357231.236 |
| 1.02697000000001e-05 | 687895574.746 | 875135434.846 | 1070722865.709 |
| 1.02868500000001e-05 | 684595435.229 | 870724432.272 | 1065124331.241 |
| 1.03040000000001e-05 | 681314056.322 | 866340188.873 | 1059561364.252 |
| 1.03211500000001e-05 | 678051319.81 | 861982519.639 | 1054033703.31 |
| 1.03383000000001e-05 | 674807108.233 | 857651240.941 | 1048541089.118 |
| 1.03554500000001e-05 | 671581304.886 | 853346170.521 | 1043083264.492 |
| 1.03726000000001e-05 | 668373793.811 | 849067127.482 | 1037659974.344 |
| 1.03897500000001e-05 | 665184459.797 | 844813932.279 | 1032270965.665 |
| 1.04069000000001e-05 | 662013188.375 | 840586406.706 | 1026915987.503 |
| 1.04240500000001e-05 | 658859865.81 | 836384373.888 | 1021594790.949 |
| 1.04412000000001e-05 | 655724379.103 | 832207658.273 | 1016307129.12 |
| 1.04583500000001e-05 | 652606615.985 | 828056085.615 | 1011052757.137 |
| 1.04755000000001e-05 | 649506464.909 | 823929482.974 | 1005831432.112 |
| 1.04926500000001e-05 | 646423815.052 | 819827678.699 | 1000642913.129 |
| 1.05098000000001e-05 | 643358556.308 | 815750502.418 | 995486961.226 |
| 1.05269500000001e-05 | 640310579.283 | 811697785.035 | 990363339.381 |
| 1.05441000000001e-05 | 637279775.294 | 807669358.713 | 985271812.491 |
| 1.05612500000001e-05 | 634266036.361 | 803665056.868 | 980212147.359 |
| 1.05784000000001e-05 | 631269255.208 | 799684714.159 | 975184112.677 |
| 1.05955500000001e-05 | 628289325.254 | 795728166.481 | 970187479.007 |
| 1.06127000000001e-05 | 625326140.613 | 791795250.949 | 965222018.77 |
| 1.06298500000001e-05 | 622379596.088 | 787885805.896 | 960287506.222 |
| 1.06470000000001e-05 | 619449587.167 | 783999670.859 | 955383717.447 |
| 1.06641500000001e-05 | 616536010.019 | 780136686.574 | 950510430.335 |
| 1.06813000000001e-05 | 613638761.493 | 776296694.961 | 945667424.568 |
| 1.06984500000001e-05 | 610757739.109 | 772479539.12 | 940854481.605 |
| 1.07156000000001e-05 | 607892841.057 | 768685063.32 | 936071384.669 |
| 1.07327500000001e-05 | 605043966.193 | 764913112.992 | 931317918.725 |
| 1.07499000000001e-05 | 602211014.036 | 761163534.716 | 926593870.473 |
| 1.07670500000001e-05 | 599393884.761 | 757436176.216 | 921899028.326 |
| 1.07842000000001e-05 | 596592479.198 | 753730886.35 | 917233182.401 |
| 1.08013500000001e-05 | 593806698.828 | 750047515.1 | 912596124.5 |
| 1.08185000000001e-05 | 591036445.775 | 746385913.567 | 907987648.097 |
| 1.08356500000001e-05 | 588281622.809 | 742745933.959 | 903407548.324 |
| 1.08528000000001e-05 | 585542133.337 | 739127429.582 | 898855621.958 |
| 1.08699500000001e-05 | 582817881.399 | 735530254.834 | 894331667.402 |
| 1.08871000000001e-05 | 580108771.668 | 731954265.198 | 889835484.676 |
| 1.09042500000001e-05 | 577414709.443 | 728399317.228 | 885366875.401 |
| 1.09214000000001e-05 | 574735600.647 | 724865268.546 | 880925642.785 |
| 1.09385500000001e-05 | 572071351.821 | 721351977.831 | 876511591.609 |
| 1.09557000000001e-05 | 569421870.121 | 717859304.813 | 872124528.214 |
| 1.09728500000001e-05 | 566787063.318 | 714387110.263 | 867764260.49 |
| 1.09900000000001e-05 | 564166839.787 | 710935255.984 | 863430597.856 |
| 1.10071500000001e-05 | 561561108.509 | 707503604.808 | 859123351.255 |
| 1.10243000000001e-05 | 558969779.066 | 704092020.582 | 854842333.135 |
| 1.10414500000001e-05 | 556392761.635 | 700700368.163 | 850587357.437 |
| 1.10586000000001e-05 | 553829966.988 | 697328513.411 | 846358239.585 |
| 1.10757500000001e-05 | 551281306.486 | 693976323.181 | 842154796.47 |
| 1.10929000000001e-05 | 548746692.073 | 690643665.313 | 837976846.44 |
| 1.11100500000001e-05 | 546226036.279 | 687330408.626 | 833824209.283 |
| 1.11272000000001e-05 | 543719252.209 | 684036422.911 | 829696706.222 |
| 1.11443500000001e-05 | 541226253.543 | 680761578.923 | 825594159.895 |
| 1.11615000000001e-05 | 538746954.535 | 677505748.374 | 821516394.348 |
| 1.11786500000001e-05 | 536281270.002 | 674268803.922 | 817463235.02 |
| 1.11958000000001e-05 | 533829115.328 | 671050619.171 | 813434508.733 |
| 1.12129500000001e-05 | 531390406.457 | 667851068.655 | 809430043.679 |
| 1.12301000000001e-05 | 528965059.886 | 664670027.839 | 805449669.408 |
| 1.12472500000001e-05 | 526552992.671 | 661507373.104 | 801493216.817 |
| 1.12644000000001e-05 | 524154122.412 | 658362981.747 | 797560518.139 |
| 1.12815500000001e-05 | 521768367.258 | 655236731.968 | 793651406.93 |
| 1.12987000000001e-05 | 519395645.901 | 652128502.868 | 789765718.058 |
| 1.13158500000001e-05 | 517035877.569 | 649038174.438 | 785903287.694 |
| 1.13330000000001e-05 | 514688982.028 | 645965627.554 | 782063953.297 |
| 1.13501500000001e-05 | 512354879.576 | 642910743.97 | 778247553.606 |
| 1.13673000000001e-05 | 510033491.038 | 639873406.31 | 774453928.628 |
| 1.13844500000001e-05 | 507724737.767 | 636853498.064 | 770682919.628 |
| 1.14016000000001e-05 | 505428541.633 | 633850903.578 | 766934369.115 |
| 1.14187500000001e-05 | 503144825.03 | 630865508.049 | 763208120.837 |
| 1.14359000000001e-05 | 500873510.864 | 627897197.52 | 759504019.764 |
| 1.14530500000001e-05 | 498614522.551 | 624945858.868 | 755821912.082 |
| 1.14702000000001e-05 | 496367784.02 | 622011379.805 | 752161645.183 |
| 1.14873500000001e-05 | 494133219.7 | 619093648.864 | 748523067.651 |
| 1.15045000000001e-05 | 491910754.526 | 616192555.399 | 744906029.255 |
| 1.15216500000001e-05 | 489700313.927 | 613307989.575 | 741310380.936 |
| 1.15388000000001e-05 | 487501823.832 | 610439842.361 | 737735974.802 |
| 1.15559500000001e-05 | 485315210.657 | 607588005.528 | 734182664.111 |
| 1.15731000000001e-05 | 483140401.309 | 604752371.638 | 730650303.267 |
| 1.15902500000001e-05 | 480977323.181 | 601932834.04 | 727138747.81 |
| 1.16074000000001e-05 | 478825904.148 | 599129286.865 | 723647854.401 |
| 1.16245500000001e-05 | 476686072.561 | 596341625.016 | 720177480.818 |
| 1.16417000000001e-05 | 474557757.251 | 593569744.167 | 716727485.945 |
| 1.16588500000001e-05 | 472440887.518 | 590813540.754 | 713297729.761 |
| 1.16760000000001e-05 | 470335393.134 | 588072911.969 | 709888073.333 |
| 1.16931500000001e-05 | 468241204.337 | 585347755.756 | 706498378.805 |
| 1.17103000000001e-05 | 466158251.826 | 582637970.803 | 703128509.388 |
| 1.17274500000001e-05 | 464086466.764 | 579943456.536 | 699778329.356 |
| 1.17446000000001e-05 | 462025780.767 | 577264113.117 | 696447704.029 |
| 1.17617500000001e-05 | 459976125.908 | 574599841.433 | 693136499.773 |
| 1.17789000000001e-05 | 457937434.709 | 571950543.095 | 689844583.982 |
| 1.17960500000001e-05 | 455909640.142 | 569316120.429 | 686571825.078 |
| 1.18132000000001e-05 | 453892675.622 | 566696476.472 | 683318092.497 |
| 1.18303500000001e-05 | 451886475.007 | 564091514.967 | 680083256.68 |
| 1.18475000000001e-05 | 449890972.594 | 561501140.357 | 676867189.068 |
| 1.18646500000001e-05 | 447906103.116 | 558925257.776 | 673669762.091 |
| 1.18818000000001e-05 | 445931801.739 | 556363773.051 | 670490849.161 |
| 1.18989500000001e-05 | 443968004.058 | 553816592.691 | 667330324.662 |
| 1.19161000000001e-05 | 442014646.098 | 551283623.882 | 664188063.944 |
| 1.19332500000001e-05 | 440071664.307 | 548764774.485 | 661063943.314 |
| 1.19504000000001e-05 | 438138995.552 | 546259953.027 | 657957840.025 |
| 1.19675500000001e-05 | 436216577.124 | 543769068.698 | 654869632.274 |
| 1.19847000000001e-05 | 434304346.726 | 541292031.345 | 651799199.19 |
| 1.20018500000001e-05 | 432402242.474 | 538828751.468 | 648746420.824 |
| 1.20190000000001e-05 | 430510202.896 | 536379140.214 | 645711178.149 |
| 1.20361500000001e-05 | 428628166.927 | 533943109.371 | 642693353.042 |
| 1.20533000000001e-05 | 426756073.905 | 531520571.366 | 639692828.287 |
| 1.20704500000001e-05 | 424893863.573 | 529111439.256 | 636709487.559 |
| 1.20876000000001e-05 | 423041476.071 | 526715626.726 | 633743215.42 |
| 1.21047500000001e-05 | 421198851.936 | 524333048.084 | 630793897.312 |
| 1.21219000000001e-05 | 419365932.099 | 521963618.256 | 627861419.548 |
| 1.21390500000001e-05 | 417542657.881 | 519607252.779 | 624945669.308 |
| 1.21562000000001e-05 | 415728970.993 | 517263867.798 | 622046534.626 |
| 1.21733500000001e-05 | 413924813.531 | 514933380.064 | 619163904.388 |
| 1.21905000000001e-05 | 412130127.974 | 512615706.922 | 616297668.322 |
| 1.22076500000001e-05 | 410344857.183 | 510310766.316 | 613447716.994 |
| 1.22248000000001e-05 | 408568944.395 | 508018476.775 | 610613941.798 |
| 1.22419500000001e-05 | 406802333.222 | 505738757.415 | 607796234.949 |
| 1.22591000000001e-05 | 405044967.652 | 503471527.932 | 604994489.478 |
| 1.22762500000001e-05 | 403296792.041 | 501216708.597 | 602208599.225 |
| 1.22934000000001e-05 | 401557751.111 | 498974220.252 | 599438458.831 |
| 1.23105500000002e-05 | 399827789.952 | 496743984.308 | 596683963.733 |
| 1.23277000000002e-05 | 398106854.017 | 494525922.735 | 593945010.155 |
| 1.23448500000002e-05 | 396394889.116 | 492319958.063 | 591221495.104 |
| 1.23620000000002e-05 | 394691841.419 | 490126013.376 | 588513316.361 |
| 1.23791500000002e-05 | 392997657.452 | 487944012.307 | 585820372.478 |
| 1.23963000000002e-05 | 391312284.092 | 485773879.034 | 583142562.767 |
| 1.24134500000002e-05 | 389635668.567 | 483615538.275 | 580479787.299 |
| 1.24306000000002e-05 | 387967758.453 | 481468915.287 | 577831946.891 |
| 1.24477500000002e-05 | 386308501.672 | 479333935.858 | 575198943.109 |
| 1.24649000000002e-05 | 384657846.489 | 477210526.304 | 572580678.252 |
| 1.24820500000002e-05 | 383015741.51 | 475098613.468 | 569977055.352 |
| 1.24992000000002e-05 | 381382135.679 | 472998124.711 | 567387978.167 |
| 1.25163500000002e-05 | 379756978.276 | 470908987.91 | 564813351.173 |
| 1.25335000000002e-05 | 378140218.915 | 468831131.456 | 562253079.561 |
| 1.25506500000002e-05 | 376531807.544 | 466764484.248 | 559707069.229 |
| 1.25678000000002e-05 | 374931694.435 | 464708975.689 | 557175226.775 |
| 1.25849500000002e-05 | 373339830.193 | 462664535.682 | 554657459.496 |
| 1.26021000000002e-05 | 371756165.744 | 460631094.628 | 552153675.377 |
| 1.26192500000002e-05 | 370180652.337 | 458608583.421 | 549663783.088 |
| 1.26364000000002e-05 | 368613241.541 | 456596933.442 | 547187691.977 |
| 1.26535500000002e-05 | 367053885.245 | 454596076.56 | 544725312.068 |
| 1.26707000000002e-05 | 365502535.653 | 452605945.123 | 542276554.049 |
| 1.26878500000002e-05 | 363959145.281 | 450626471.959 | 539841329.273 |
| 1.27050000000002e-05 | 362423666.959 | 448657590.369 | 537419549.75 |
| 1.27221500000002e-05 | 360896053.824 | 446699234.125 | 535011128.138 |
| 1.27393000000002e-05 | 359376259.322 | 444751337.466 | 532615977.745 |
| 1.27564500000002e-05 | 357864237.204 | 442813835.093 | 530234012.518 |
| 1.27736000000002e-05 | 356359941.524 | 440886662.169 | 527865147.04 |
| 1.27907500000002e-05 | 354863326.635 | 438969754.312 | 525509296.523 |
| 1.28079000000002e-05 | 353374347.191 | 437063047.592 | 523166376.806 |
| 1.28250500000002e-05 | 351892958.142 | 435166478.53 | 520836304.348 |
| 1.28422000000002e-05 | 350419114.733 | 433279984.092 | 518518996.22 |
| 1.28593500000002e-05 | 348952772.501 | 431403501.685 | 516214370.108 |
| 1.28765000000002e-05 | 347493887.275 | 429536969.157 | 513922344.298 |
| 1.28936500000002e-05 | 346042415.17 | 427680324.791 | 511642837.68 |
| 1.29108000000002e-05 | 344598312.591 | 425833507.302 | 509375769.736 |
| 1.29279500000002e-05 | 343161536.225 | 423996455.834 | 507121060.54 |
| 1.29451000000002e-05 | 341732043.042 | 422169109.957 | 504878630.753 |
| 1.29622500000002e-05 | 340309790.295 | 420351409.663 | 502648401.613 |
| 1.29794000000002e-05 | 338894735.513 | 418543295.364 | 500430294.937 |
| 1.29965500000002e-05 | 337486836.503 | 416744707.887 | 498224233.113 |
| 1.30137000000002e-05 | 336086051.347 | 414955588.472 | 496030139.095 |
| 1.30308500000002e-05 | 334692338.4 | 413175878.77 | 493847936.399 |
| 1.30480000000002e-05 | 333305656.288 | 411405520.837 | 491677549.099 |
| 1.30651500000002e-05 | 331925963.906 | 409644457.133 | 489518901.822 |
| 1.30823000000002e-05 | 330553220.416 | 407892630.518 | 487371919.744 |
| 1.30994500000002e-05 | 329187385.248 | 406149984.249 | 485236528.585 |
| 1.31166000000002e-05 | 327828418.092 | 404416461.98 | 483112654.603 |
| 1.31337500000002e-05 | 326476278.903 | 402692007.752 | 481000224.595 |
| 1.31509000000002e-05 | 325130927.894 | 400976565.997 | 478899165.885 |
| 1.31680500000002e-05 | 323792325.537 | 399270081.533 | 476809406.327 |
| 1.31852000000002e-05 | 322460432.56 | 397572499.558 | 474730874.296 |
| 1.32023500000002e-05 | 321135209.948 | 395883765.65 | 472663498.686 |
| 1.32195000000002e-05 | 319816618.935 | 394203825.766 | 470607208.904 |
| 1.32366500000002e-05 | 318504621.009 | 392532626.234 | 468561934.868 |
| 1.32538000000002e-05 | 317199177.907 | 390870113.755 | 466527607.002 |
| 1.32709500000002e-05 | 315900251.613 | 389216235.395 | 464504156.233 |
| 1.32881000000002e-05 | 314607804.358 | 387570938.59 | 462491513.982 |
| 1.33052500000002e-05 | 313321798.615 | 385934171.134 | 460489612.168 |
| 1.33224000000002e-05 | 312042197.102 | 384305881.183 | 458498383.197 |
| 1.33395500000002e-05 | 310768962.778 | 382686017.25 | 456517759.963 |
| 1.33567000000002e-05 | 309502058.839 | 381074528.203 | 454547675.842 |
| 1.33738500000002e-05 | 308241448.72 | 379471363.259 | 452588064.685 |
| 1.33910000000002e-05 | 306987096.093 | 377876471.987 | 450638860.823 |
| 1.34081500000002e-05 | 305738964.862 | 376289804.301 | 448699999.052 |
| 1.34253000000002e-05 | 304497019.166 | 374711310.459 | 446771414.638 |
| 1.34424500000002e-05 | 303261223.372 | 373140941.06 | 444853043.31 |
| 1.34596000000002e-05 | 302031542.08 | 371578647.042 | 442944821.255 |
| 1.34767500000002e-05 | 300807940.115 | 370024379.678 | 441046685.117 |
| 1.34939000000002e-05 | 299590382.531 | 368478090.576 | 439158571.992 |
| 1.35110500000002e-05 | 298378834.603 | 366939731.673 | 437280419.425 |
| 1.35282000000002e-05 | 297173261.834 | 365409255.237 | 435412165.404 |
| 1.35453500000002e-05 | 295973629.945 | 363886613.861 | 433553748.36 |
| 1.35625000000002e-05 | 294779904.878 | 362371760.459 | 431705107.162 |
| 1.35796500000002e-05 | 293592052.794 | 360864648.271 | 429866181.114 |
| 1.35968000000002e-05 | 292410040.07 | 359365230.852 | 428036909.949 |
| 1.36139500000002e-05 | 291233833.301 | 357873462.075 | 426217233.83 |
| 1.36311000000002e-05 | 290063399.293 | 356389296.125 | 424407093.342 |
| 1.36482500000002e-05 | 288898705.068 | 354912687.501 | 422606429.493 |
| 1.36654000000002e-05 | 287739717.855 | 353443591.011 | 420815183.707 |
| 1.36825500000002e-05 | 286586405.096 | 351981961.768 | 419033297.823 |
| 1.36997000000002e-05 | 285438734.441 | 350527755.19 | 417260714.09 |
| 1.37168500000002e-05 | 284296673.744 | 349080927.001 | 415497375.167 |
| 1.37340000000002e-05 | 283160191.068 | 347641433.219 | 413743224.115 |
| 1.37511500000002e-05 | 282029254.677 | 346209230.165 | 411998204.398 |
| 1.37683000000002e-05 | 280903833.04 | 344784274.454 | 410262259.877 |
| 1.37854500000002e-05 | 279783894.825 | 343366522.993 | 408535334.809 |
| 1.38026000000002e-05 | 278669408.901 | 341955932.981 | 406817373.843 |
| 1.38197500000002e-05 | 277560344.335 | 340552461.907 | 405108322.017 |
| 1.38369000000002e-05 | 276456670.391 | 339156067.547 | 403408124.753 |
| 1.38540500000002e-05 | 275358356.529 | 337766707.96 | 401716727.858 |
| 1.38712000000002e-05 | 274265372.402 | 336384341.489 | 400034077.517 |
| 1.38883500000002e-05 | 273177687.858 | 335008926.756 | 398360120.295 |
| 1.39055000000002e-05 | 272095272.936 | 333640422.664 | 396694803.127 |
| 1.39226500000002e-05 | 271018097.863 | 332278788.39 | 395038073.321 |
| 1.39398000000002e-05 | 269946133.059 | 330923983.387 | 393389878.553 |
| 1.39569500000002e-05 | 268879349.128 | 329575967.379 | 391750166.863 |
| 1.39741000000002e-05 | 267817716.863 | 328234700.36 | 390118886.656 |
| 1.39912500000002e-05 | 266761207.241 | 326900142.594 | 388495986.694 |
| 1.40084000000002e-05 | 265709791.422 | 325572254.61 | 386881416.096 |
| 1.40255500000002e-05 | 264663440.751 | 324250997.201 | 385275124.336 |
| 1.40427000000002e-05 | 263622126.752 | 322936331.422 | 383677061.238 |
| 1.40598500000002e-05 | 262585821.131 | 321628218.591 | 382087176.976 |
| 1.40770000000002e-05 | 261554495.77 | 320326620.281 | 380505422.069 |
| 1.40941500000002e-05 | 260528122.732 | 319031498.324 | 378931747.379 |
| 1.41113000000002e-05 | 259506674.254 | 317742814.805 | 377366104.107 |
| 1.41284500000002e-05 | 258490122.75 | 316460532.063 | 375808443.795 |
| 1.41456000000002e-05 | 257478440.806 | 315184612.687 | 374258718.317 |
| 1.41627500000002e-05 | 256471601.183 | 313915019.515 | 372716879.882 |
| 1.41799000000002e-05 | 255469576.811 | 312651715.633 | 371182881.027 |
| 1.41970500000002e-05 | 254472340.793 | 311394664.373 | 369656674.618 |
| 1.42142000000002e-05 | 253479866.4 | 310143829.307 | 368138213.844 |
| 1.42313500000002e-05 | 252492127.07 | 308899174.254 | 366627452.22 |
| 1.42485000000002e-05 | 251509096.411 | 307660663.268 | 365124343.577 |
| 1.42656500000002e-05 | 250530748.194 | 306428260.645 | 363628842.065 |
| 1.42828000000002e-05 | 249557056.356 | 305201930.915 | 362140902.15 |
| 1.42999500000002e-05 | 248587994.996 | 303981638.844 | 360660478.609 |
| 1.43171000000002e-05 | 247623538.379 | 302767349.431 | 359187526.531 |
| 1.43342500000002e-05 | 246663660.927 | 301559027.905 | 357722001.31 |
| 1.43514000000002e-05 | 245708337.225 | 300356639.727 | 356263858.649 |
| 1.43685500000002e-05 | 244757542.016 | 299160150.584 | 354813054.551 |
| 1.43857000000002e-05 | 243811250.201 | 297969526.389 | 353369545.322 |
| 1.44028500000002e-05 | 242869436.839 | 296784733.282 | 351933287.565 |
| 1.44200000000002e-05 | 241932077.144 | 295605737.622 | 350504238.18 |
| 1.44371500000002e-05 | 240999146.485 | 294432505.994 | 349082354.361 |
| 1.44543000000002e-05 | 240070620.384 | 293265005.199 | 347667593.593 |
| 1.44714500000002e-05 | 239146474.518 | 292103202.258 | 346259913.651 |
| 1.44886000000002e-05 | 238226684.712 | 290947064.408 | 344859272.597 |
| 1.45057500000002e-05 | 237311226.945 | 289796559.101 | 343465628.779 |
| 1.45229000000002e-05 | 236400077.345 | 288651654.002 | 342078940.827 |
| 1.45400500000002e-05 | 235493212.186 | 287512316.988 | 340699167.651 |
| 1.45572000000002e-05 | 234590607.894 | 286378516.146 | 339326268.441 |
| 1.45743500000002e-05 | 233692241.037 | 285250219.774 | 337960202.663 |
| 1.45915000000002e-05 | 232798088.331 | 284127396.373 | 336600930.058 |
| 1.46086500000002e-05 | 231908126.638 | 283010014.653 | 335248410.637 |
| 1.46258000000002e-05 | 231022332.96 | 281898043.528 | 333902604.685 |
| 1.46429500000002e-05 | 230140684.444 | 280791452.113 | 332563472.751 |
| 1.46601000000002e-05 | 229263158.378 | 279690209.726 | 331230975.655 |
| 1.46772500000002e-05 | 228389732.192 | 278594285.884 | 329905074.476 |
| 1.46944000000002e-05 | 227520383.454 | 277503650.302 | 328585730.558 |
| 1.47115500000002e-05 | 226655089.87 | 276418272.892 | 327272905.506 |
| 1.47287000000002e-05 | 225793829.287 | 275338123.763 | 325966561.181 |
| 1.47458500000002e-05 | 224936579.687 | 274263173.217 | 324666659.702 |
| 1.47630000000002e-05 | 224083319.188 | 273193391.748 | 323373163.441 |
| 1.47801500000002e-05 | 223234026.043 | 272128750.042 | 322086035.023 |
| 1.47973000000002e-05 | 222388678.639 | 271069218.975 | 320805237.324 |
| 1.48144500000002e-05 | 221547255.497 | 270014769.612 | 319530733.469 |
| 1.48316000000002e-05 | 220709735.27 | 268965373.203 | 318262486.827 |
| 1.48487500000002e-05 | 219876096.743 | 267921001.188 | 317000461.015 |
| 1.48659000000002e-05 | 219046318.831 | 266881625.187 | 315744619.892 |
| 1.48830500000002e-05 | 218220380.578 | 265847217.006 | 314494927.558 |
| 1.49002000000002e-05 | 217398261.158 | 264817748.632 | 313251348.353 |
| 1.49173500000002e-05 | 216579939.872 | 263793192.232 | 312013846.853 |
| 1.49345000000002e-05 | 215765396.148 | 262773520.153 | 310782387.874 |
| 1.49516500000002e-05 | 214954609.542 | 261758704.92 | 309556936.46 |
| 1.49688000000002e-05 | 214147559.734 | 260748719.234 | 308337457.893 |
| 1.49859500000002e-05 | 213344226.528 | 259743535.973 | 307123917.683 |
| 1.50031000000002e-05 | 212544589.852 | 258743128.187 | 305916281.568 |
| 1.50202500000002e-05 | 211748629.758 | 257747469.1 | 304714515.516 |
| 1.50374000000002e-05 | 210956326.419 | 256756532.108 | 303518585.718 |
| 1.50545500000002e-05 | 210167660.129 | 255770290.778 | 302328458.59 |
| 1.50717000000002e-05 | 209382611.303 | 254788718.844 | 301144100.77 |
| 1.50888500000002e-05 | 208601160.475 | 253811790.209 | 299965479.116 |
| 1.51060000000002e-05 | 207823288.298 | 252839478.945 | 298792560.706 |
| 1.51231500000002e-05 | 207048975.543 | 251871759.287 | 297625312.835 |
| 1.51403000000002e-05 | 206278203.1 | 250908605.635 | 296463703.013 |
| 1.51574500000002e-05 | 205510951.971 | 249949992.553 | 295307698.963 |
| 1.51746000000002e-05 | 204747203.278 | 248995894.767 | 294157268.624 |
| 1.51917500000002e-05 | 203986938.256 | 248046287.164 | 293012380.142 |
| 1.52089000000002e-05 | 203230138.253 | 247101144.789 | 291873001.875 |
| 1.52260500000002e-05 | 202476784.733 | 246160442.849 | 290739102.388 |
| 1.52432000000002e-05 | 201726859.27 | 245224156.706 | 289610650.451 |
| 1.52603500000002e-05 | 200980343.552 | 244292261.88 | 288487615.041 |
| 1.52775000000002e-05 | 200237219.375 | 243364734.045 | 287369965.336 |
| 1.52946500000002e-05 | 199497468.649 | 242441549.03 | 286257670.718 |
| 1.53118000000002e-05 | 198761073.391 | 241522682.817 | 285150700.767 |
| 1.53289500000002e-05 | 198028015.727 | 240608111.541 | 284049025.264 |
| 1.53461000000002e-05 | 197298277.892 | 239697811.485 | 282952614.185 |
| 1.53632500000002e-05 | 196571842.229 | 238791759.087 | 281861437.704 |
| 1.53804000000002e-05 | 195848691.187 | 237889930.929 | 280775466.188 |
| 1.53975500000002e-05 | 195128807.319 | 236992303.743 | 279694670.197 |
| 1.54147000000002e-05 | 194412173.285 | 236098854.407 | 278619020.484 |
| 1.54318500000002e-05 | 193698771.852 | 235209559.947 | 277548487.991 |
| 1.54490000000002e-05 | 192988585.886 | 234324397.531 | 276483043.848 |
| 1.54661500000002e-05 | 192281598.359 | 233443344.471 | 275422659.376 |
| 1.54833000000002e-05 | 191577792.346 | 232566378.223 | 274367306.077 |
| 1.55004500000002e-05 | 190877151.022 | 231693476.384 | 273316955.641 |
| 1.55176000000002e-05 | 190179657.664 | 230824616.692 | 272271579.942 |
| 1.55347500000002e-05 | 189485295.65 | 229959777.024 | 271231151.033 |
| 1.55519000000002e-05 | 188794048.457 | 229098935.397 | 270195641.15 |
| 1.55690500000002e-05 | 188105899.661 | 228242069.964 | 269165022.707 |
| 1.55862000000002e-05 | 187420832.937 | 227389159.016 | 268139268.298 |
| 1.56033500000002e-05 | 186738832.057 | 226540180.979 | 267118350.691 |
| 1.56205000000002e-05 | 186059880.892 | 225695114.416 | 266102242.833 |
| 1.56376500000002e-05 | 185383963.408 | 224853938.021 | 265090917.842 |
| 1.56548000000002e-05 | 184711063.667 | 224016630.622 | 264084349.01 |
| 1.56719500000002e-05 | 184041165.825 | 223183171.181 | 263082509.802 |
| 1.56891000000002e-05 | 183374254.137 | 222353538.788 | 262085373.851 |
| 1.57062500000002e-05 | 182710312.946 | 221527712.665 | 261092914.962 |
| 1.57234000000002e-05 | 182049326.694 | 220705672.165 | 260105107.106 |
| 1.57405500000002e-05 | 181391279.912 | 219887396.765 | 259121924.422 |
| 1.57577000000002e-05 | 180736157.224 | 219072866.074 | 258143341.213 |
| 1.57748500000002e-05 | 180083943.346 | 218262059.824 | 257169331.949 |
| 1.57920000000002e-05 | 179434623.085 | 217454957.877 | 256199871.26 |
| 1.58091500000002e-05 | 178788181.339 | 216651540.215 | 255234933.941 |
| 1.58263000000002e-05 | 178144603.094 | 215851786.947 | 254274494.946 |
| 1.58434500000002e-05 | 177503873.425 | 215055678.305 | 253318529.39 |
| 1.58606000000002e-05 | 176865977.499 | 214263194.643 | 252367012.546 |
| 1.58777500000002e-05 | 176230900.567 | 213474316.436 | 251419919.843 |
| 1.58949000000002e-05 | 175598627.969 | 212689024.28 | 250477226.868 |
| 1.59120500000002e-05 | 174969145.133 | 211907298.891 | 249538909.365 |
| 1.59292000000002e-05 | 174342437.57 | 211129121.104 | 248604943.227 |
| 1.59463500000002e-05 | 173718490.881 | 210354471.871 | 247675304.505 |
| 1.59635000000002e-05 | 173097290.748 | 209583332.263 | 246749969.399 |
| 1.59806500000002e-05 | 172478822.941 | 208815683.467 | 245828914.26 |
| 1.59978000000002e-05 | 171863073.312 | 208051506.784 | 244912115.591 |
| 1.60149500000002e-05 | 171250027.797 | 207290783.633 | 243999550.041 |
| 1.60321000000002e-05 | 170639672.415 | 206533495.544 | 243091194.407 |
| 1.60492500000002e-05 | 170031993.266 | 205779624.163 | 242187025.634 |
| 1.60664000000002e-05 | 169426976.535 | 205029151.247 | 241287020.811 |
| 1.60835500000002e-05 | 168824608.485 | 204282058.665 | 240391157.174 |
| 1.61007000000002e-05 | 168224875.463 | 203538328.398 | 239499412.098 |
| 1.61178500000002e-05 | 167627763.892 | 202797942.535 | 238611763.104 |
| 1.61350000000002e-05 | 167033260.279 | 202060883.277 | 237728187.853 |
| 1.61521500000002e-05 | 166441351.208 | 201327132.932 | 236848664.148 |
| 1.61693000000002e-05 | 165852023.342 | 200596673.917 | 235973169.93 |
| 1.61864500000002e-05 | 165265263.423 | 199869488.756 | 235101683.278 |
| 1.62036000000002e-05 | 164681058.268 | 199145560.08 | 234234182.408 |
| 1.62207500000002e-05 | 164099394.775 | 198424870.624 | 233370645.676 |
| 1.62379000000002e-05 | 163520259.916 | 197707403.231 | 232511051.57 |
| 1.62550500000002e-05 | 162943640.74 | 196993140.846 | 231655378.713 |
| 1.62722000000002e-05 | 162369524.372 | 196282066.518 | 230803605.864 |
| 1.62893500000002e-05 | 161797898.012 | 195574163.4 | 229955711.911 |
| 1.63065000000002e-05 | 161228748.933 | 194869414.746 | 229111675.877 |
| 1.63236500000002e-05 | 160662064.485 | 194167803.913 | 228271476.913 |
| 1.63408000000002e-05 | 160097832.09 | 193469314.358 | 227435094.304 |
| 1.63579500000002e-05 | 159536039.244 | 192773929.637 | 226602507.459 |
| 1.63751000000002e-05 | 158976673.515 | 192081633.408 | 225773695.918 |
| 1.63922500000002e-05 | 158419722.544 | 191392409.425 | 224948639.349 |
| 1.64094000000002e-05 | 157865174.044 | 190706241.543 | 224127317.543 |
| 1.64265500000002e-05 | 157313015.798 | 190023113.713 | 223309710.419 |
| 1.64437000000002e-05 | 156763235.661 | 189343009.983 | 222495798.02 |
| 1.64608500000002e-05 | 156215821.56 | 188665914.496 | 221685560.513 |
| 1.64780000000002e-05 | 155670761.488 | 187991811.493 | 220878978.186 |
| 1.64951500000002e-05 | 155128043.512 | 187320685.309 | 220076031.452 |
| 1.65123000000002e-05 | 154587655.764 | 186652520.37 | 219276700.841 |
| 1.65294500000002e-05 | 154049586.448 | 185987301.202 | 218480967.007 |
| 1.65466000000002e-05 | 153513823.835 | 185325012.417 | 217688810.722 |
| 1.65637500000002e-05 | 152980356.262 | 184665638.725 | 216900212.875 |
| 1.65809000000002e-05 | 152449172.137 | 184009164.924 | 216115154.476 |
| 1.65980500000002e-05 | 151920259.931 | 183355575.905 | 215333616.649 |
| 1.66152000000002e-05 | 151393608.185 | 182704856.649 | 214555580.637 |
| 1.66323500000002e-05 | 150869205.504 | 182056992.227 | 213781027.794 |
| 1.66495000000002e-05 | 150347040.558 | 181411967.799 | 213009939.592 |
| 1.66666500000002e-05 | 149827102.084 | 180769768.613 | 212242297.617 |
| 1.66838000000002e-05 | 149309378.883 | 180130380.007 | 211478083.566 |
| 1.67009500000002e-05 | 148793859.821 | 179493787.404 | 210717279.248 |
| 1.67181000000002e-05 | 148280533.826 | 178859976.317 | 209959866.585 |
| 1.67352500000002e-05 | 147769389.892 | 178228932.342 | 209205827.608 |
| 1.67524000000002e-05 | 147260417.075 | 177600641.163 | 208455144.46 |
| 1.67695500000002e-05 | 146753604.493 | 176975088.549 | 207707799.392 |
| 1.67867000000002e-05 | 146248941.327 | 176352260.352 | 206963774.761 |
| 1.68038500000002e-05 | 145746416.821 | 175732142.51 | 206223053.035 |
| 1.68210000000002e-05 | 145246020.28 | 175114721.043 | 205485616.788 |
| 1.68381500000002e-05 | 144747741.068 | 174499982.054 | 204751448.698 |
| 1.68553000000002e-05 | 144251568.613 | 173887911.73 | 204020531.552 |
| 1.68724500000002e-05 | 143757492.402 | 173278496.338 | 203292848.237 |
| 1.68896000000002e-05 | 143265501.981 | 172671722.228 | 202568381.749 |
| 1.69067500000002e-05 | 142775586.957 | 172067575.828 | 201847115.184 |
| 1.69239000000002e-05 | 142287736.995 | 171466043.649 | 201129031.741 |
| 1.69410500000002e-05 | 141801941.821 | 170867112.281 | 200414114.721 |
| 1.69582000000002e-05 | 141318191.218 | 170270768.391 | 199702347.527 |
| 1.69753500000002e-05 | 140836475.026 | 169676998.728 | 198993713.661 |
| 1.69925000000002e-05 | 140356783.144 | 169085790.116 | 198288196.725 |
| 1.70096500000002e-05 | 139879105.53 | 168497129.459 | 197585780.422 |
| 1.70268000000002e-05 | 139403432.196 | 167911003.736 | 196886448.55 |
| 1.70439500000002e-05 | 138929753.212 | 167327400.004 | 196190185.008 |
| 1.70611000000002e-05 | 138458058.704 | 166746305.397 | 195496973.789 |
| 1.70782500000002e-05 | 137988338.855 | 166167707.121 | 194806798.986 |
| 1.70954000000002e-05 | 137520583.903 | 165591592.46 | 194119644.785 |
| 1.71125500000002e-05 | 137054784.141 | 165017948.772 | 193435495.467 |
| 1.71297000000002e-05 | 136590929.916 | 164446763.488 | 192754335.408 |
| 1.71468500000002e-05 | 136129011.631 | 163878024.114 | 192076149.08 |
| 1.71640000000002e-05 | 135669019.743 | 163311718.229 | 191400921.044 |
| 1.71811500000002e-05 | 135210944.763 | 162747833.483 | 190728635.957 |
| 1.71983000000002e-05 | 134754777.253 | 162186357.599 | 190059278.567 |
| 1.72154500000002e-05 | 134300507.832 | 161627278.373 | 189392833.711 |
| 1.72326000000002e-05 | 133848127.169 | 161070583.67 | 188729286.321 |
| 1.72497500000002e-05 | 133397625.988 | 160516261.427 | 188068621.415 |
| 1.72669000000002e-05 | 132948995.062 | 159964299.651 | 187410824.102 |
| 1.72840500000002e-05 | 132502225.219 | 159414686.418 | 186755879.581 |
| 1.73012000000002e-05 | 132057307.336 | 158867409.875 | 186103773.137 |
| 1.73183500000002e-05 | 131614232.344 | 158322458.237 | 185454490.144 |
| 1.73355000000002e-05 | 131172991.221 | 157779819.787 | 184808016.063 |
| 1.73526500000002e-05 | 130733574.999 | 157239482.876 | 184164336.442 |
| 1.73698000000002e-05 | 130295974.759 | 156701435.924 | 183523436.914 |
| 1.73869500000002e-05 | 129860181.632 | 156165667.416 | 182885303.196 |
| 1.74041000000002e-05 | 129426186.798 | 155632165.905 | 182249921.093 |
| 1.74212500000002e-05 | 128993981.487 | 155100920.01 | 181617276.492 |
| 1.74384000000002e-05 | 128563556.979 | 154571918.416 | 180987355.363 |
| 1.74555500000002e-05 | 128134904.6 | 154045149.872 | 180360143.762 |
| 1.74727000000002e-05 | 127708015.726 | 153520603.193 | 179735627.824 |
| 1.74898500000002e-05 | 127282881.783 | 152998267.26 | 179113793.767 |
| 1.75070000000002e-05 | 126859494.241 | 152478131.015 | 178494627.893 |
| 1.75241500000002e-05 | 126437844.62 | 151960183.467 | 177878116.582 |
| 1.75413000000002e-05 | 126017924.486 | 151444413.685 | 177264246.294 |
| 1.75584500000002e-05 | 125599725.453 | 150930810.803 | 176653003.571 |
| 1.75756000000003e-05 | 125183239.181 | 150419364.017 | 176044375.033 |
| 1.75927500000002e-05 | 124768457.377 | 149910062.585 | 175438347.378 |
| 1.76099000000003e-05 | 124355371.792 | 149402895.826 | 174834907.384 |
| 1.76270500000003e-05 | 123943974.224 | 148897853.122 | 174234041.905 |
| 1.76442000000003e-05 | 123534256.519 | 148394923.913 | 173635737.873 |
| 1.76613500000003e-05 | 123126210.563 | 147894097.703 | 173039982.297 |
| 1.76785000000003e-05 | 122719828.291 | 147395364.053 | 172446762.261 |
| 1.76956500000003e-05 | 122315101.682 | 146898712.585 | 171856064.926 |
| 1.77128000000003e-05 | 121912022.757 | 146404132.981 | 171267877.527 |
| 1.77299500000003e-05 | 121510583.584 | 145911614.98 | 170682187.374 |
| 1.77471000000003e-05 | 121110776.273 | 145421148.382 | 170098981.851 |
| 1.77642500000003e-05 | 120712592.979 | 144932723.042 | 169518248.415 |
| 1.77814000000003e-05 | 120316025.898 | 144446328.877 | 168939974.599 |
| 1.77985500000003e-05 | 119921067.271 | 143961955.857 | 168364148.006 |
| 1.78157000000003e-05 | 119527709.381 | 143479594.012 | 167790756.312 |
| 1.78328500000003e-05 | 119135944.553 | 142999233.429 | 167219787.263 |
| 1.78500000000003e-05 | 118745765.156 | 142520864.247 | 166651228.68 |
| 1.78671500000003e-05 | 118357163.599 | 142044476.667 | 166085068.452 |
| 1.78843000000003e-05 | 117970132.333 | 141570060.942 | 165521294.539 |
| 1.79014500000003e-05 | 117584663.851 | 141097607.38 | 164959894.971 |
| 1.79186000000003e-05 | 117200750.687 | 140627106.345 | 164400857.846 |
| 1.79357500000003e-05 | 116818385.416 | 140158548.257 | 163844171.334 |
| 1.79529000000003e-05 | 116437560.653 | 139691923.586 | 163289823.671 |
| 1.79700500000003e-05 | 116058269.055 | 139227222.861 | 162737803.162 |
| 1.79872000000003e-05 | 115680503.317 | 138764436.66 | 162188098.178 |
| 1.80043500000003e-05 | 115304256.176 | 138303555.617 | 161640697.161 |
| 1.80215000000003e-05 | 114929520.408 | 137844570.418 | 161095588.616 |
| 1.80386500000003e-05 | 114556288.827 | 137387471.801 | 160552761.115 |
| 1.80558000000003e-05 | 114184554.289 | 136932250.557 | 160012203.297 |
| 1.80729500000003e-05 | 113814309.686 | 136478897.528 | 159473903.865 |
| 1.80901000000003e-05 | 113445547.95 | 136027403.608 | 158937851.59 |
| 1.81072500000003e-05 | 113078262.053 | 135577759.743 | 158404035.303 |
| 1.81244000000003e-05 | 112712445.002 | 135129956.927 | 157872443.903 |
| 1.81415500000003e-05 | 112348089.845 | 134683986.209 | 157343066.351 |
| 1.81587000000003e-05 | 111985189.667 | 134239838.684 | 156815891.672 |
| 1.81758500000003e-05 | 111623737.589 | 133797505.499 | 156290908.952 |
| 1.81930000000003e-05 | 111263726.772 | 133356977.851 | 155768107.343 |
| 1.82101500000003e-05 | 110905150.411 | 132918246.983 | 155247476.056 |
| 1.82273000000003e-05 | 110548001.741 | 132481304.192 | 154729004.365 |
| 1.82444500000003e-05 | 110192274.03 | 132046140.82 | 154212681.605 |
| 1.82616000000003e-05 | 109837960.587 | 131612748.259 | 153698497.173 |
| 1.82787500000003e-05 | 109485054.754 | 131181117.947 | 153186440.524 |
| 1.82959000000003e-05 | 109133549.908 | 130751241.372 | 152676501.177 |
| 1.83130500000003e-05 | 108783439.466 | 130323110.068 | 152168668.706 |
| 1.83302000000003e-05 | 108434716.877 | 129896715.618 | 151662932.748 |
| 1.83473500000003e-05 | 108087375.627 | 129472049.65 | 151159282.998 |
| 1.83645000000003e-05 | 107741409.235 | 129049103.838 | 150657709.209 |
| 1.83816500000003e-05 | 107396811.258 | 128627869.904 | 150158201.192 |
| 1.83988000000003e-05 | 107053575.285 | 128208339.616 | 149660748.816 |
| 1.84159500000003e-05 | 106711694.942 | 127790504.786 | 149165342.01 |
| 1.84331000000003e-05 | 106371163.887 | 127374357.273 | 148671970.755 |
| 1.84502500000003e-05 | 106031975.813 | 126959888.98 | 148180625.094 |
| 1.84674000000003e-05 | 105694124.447 | 126547091.856 | 147691295.123 |
| 1.84845500000003e-05 | 105357603.55 | 126135957.893 | 147203970.996 |
| 1.85017000000003e-05 | 105022406.915 | 125726479.128 | 146718642.92 |
| 1.85188500000003e-05 | 104688528.37 | 125318647.642 | 146235301.159 |
| 1.85360000000003e-05 | 104355961.775 | 124912455.561 | 145753936.033 |
| 1.85531500000003e-05 | 104024701.024 | 124507895.052 | 145274537.916 |
| 1.85703000000003e-05 | 103694740.042 | 124104958.327 | 144797097.234 |
| 1.85874500000003e-05 | 103366072.787 | 123703637.64 | 144321604.469 |
| 1.86046000000003e-05 | 103038693.25 | 123303925.288 | 143848050.157 |
| 1.86217500000003e-05 | 102712595.454 | 122905813.611 | 143376424.886 |
| 1.86389000000003e-05 | 102387773.454 | 122509294.989 | 142906719.296 |
| 1.86560500000003e-05 | 102064221.335 | 122114361.846 | 142438924.083 |
| 1.86732000000003e-05 | 101741933.215 | 121721006.647 | 141973029.991 |
| 1.86903500000003e-05 | 101420903.244 | 121329221.899 | 141509027.818 |
| 1.87075000000003e-05 | 101101125.601 | 120939000.147 | 141046908.414 |
| 1.87246500000003e-05 | 100782594.498 | 120550333.981 | 140586662.679 |
| 1.87418000000003e-05 | 100465304.177 | 120163216.029 | 140128281.565 |
| 1.87589500000003e-05 | 100149248.91 | 119777638.96 | 139671756.074 |
| 1.87761000000003e-05 | 99834423.001 | 119393595.483 | 139217077.258 |
| 1.87932500000003e-05 | 99520820.781 | 119011078.347 | 138764236.218 |
| 1.88104000000003e-05 | 99208436.615 | 118630080.34 | 138313224.108 |
| 1.88275500000003e-05 | 98897264.895 | 118250594.29 | 137864032.127 |
| 1.88447000000003e-05 | 98587300.045 | 117872613.064 | 137416651.526 |
| 1.88618500000003e-05 | 98278536.516 | 117496129.567 | 136971073.604 |
| 1.88790000000003e-05 | 97970968.789 | 117121136.745 | 136527289.708 |
| 1.88961500000003e-05 | 97664591.376 | 116747627.579 | 136085291.232 |
| 1.89133000000003e-05 | 97359398.816 | 116375595.09 | 135645069.62 |
| 1.89304500000003e-05 | 97055385.678 | 116005032.337 | 135206616.362 |
| 1.89476000000003e-05 | 96752546.558 | 115635932.417 | 134769922.996 |
| 1.89647500000003e-05 | 96450876.083 | 115268288.463 | 134334981.106 |
| 1.89819000000003e-05 | 96150368.906 | 114902093.647 | 133901782.322 |
| 1.89990500000003e-05 | 95851019.708 | 114537341.175 | 133470318.324 |
| 1.90162000000003e-05 | 95552823.201 | 114174024.294 | 133040580.832 |
| 1.90333500000003e-05 | 95255774.121 | 113812136.284 | 132612561.617 |
| 1.90505000000003e-05 | 94959867.235 | 113451670.463 | 132186252.494 |
| 1.90676500000003e-05 | 94665097.334 | 113092620.185 | 131761645.32 |
| 1.90848000000003e-05 | 94371459.24 | 112734978.84 | 131338732.001 |
| 1.91019500000003e-05 | 94078947.799 | 112378739.851 | 130917504.486 |
| 1.91191000000003e-05 | 93787557.886 | 112023896.681 | 130497954.768 |
| 1.91362500000003e-05 | 93497284.402 | 111670442.825 | 130080074.885 |
| 1.91534000000003e-05 | 93208122.274 | 111318371.814 | 129663856.916 |
| 1.91705500000003e-05 | 92920066.458 | 110967677.213 | 129249292.987 |
| 1.91877000000003e-05 | 92633111.933 | 110618352.623 | 128836375.265 |
| 1.92048500000003e-05 | 92347253.707 | 110270391.679 | 128425095.961 |
| 1.92220000000003e-05 | 92062486.813 | 109923788.048 | 128015447.329 |
| 1.92391500000003e-05 | 91778806.309 | 109578535.435 | 127607421.663 |
| 1.92563000000003e-05 | 91496207.279 | 109234627.574 | 127201011.302 |
| 1.92734500000003e-05 | 91214684.835 | 108892058.237 | 126796208.626 |
| 1.92906000000003e-05 | 90934234.112 | 108550821.227 | 126393006.055 |
| 1.93077500000003e-05 | 90654850.271 | 108210910.38 | 125991396.053 |
| 1.93249000000003e-05 | 90376528.497 | 107872319.565 | 125591371.122 |
| 1.93420500000003e-05 | 90099264.002 | 107535042.685 | 125192923.809 |
| 1.93592000000003e-05 | 89823052.022 | 107199073.674 | 124796046.697 |
| 1.93763500000003e-05 | 89547887.818 | 106864406.499 | 124400732.414 |
| 1.93935000000003e-05 | 89273766.674 | 106531035.16 | 124006973.623 |
| 1.94106500000003e-05 | 89000683.9 | 106198953.688 | 123614763.031 |
| 1.94278000000003e-05 | 88728634.83 | 105868156.146 | 123224093.383 |
| 1.94449500000003e-05 | 88457614.823 | 105538636.627 | 122834957.464 |
| 1.94621000000003e-05 | 88187619.26 | 105210389.258 | 122447348.096 |
| 1.94792500000003e-05 | 87918643.547 | 104883408.197 | 122061258.144 |
| 1.94964000000003e-05 | 87650683.114 | 104557687.63 | 121676680.506 |
| 1.95135500000003e-05 | 87383733.414 | 104233221.777 | 121293608.125 |
| 1.95307000000003e-05 | 87117789.924 | 103910004.888 | 120912033.976 |
| 1.95478500000003e-05 | 86852848.143 | 103588031.242 | 120531951.075 |
| 1.95650000000003e-05 | 86588903.595 | 103267295.15 | 120153352.477 |
| 1.95821500000003e-05 | 86325951.826 | 102947790.952 | 119776231.272 |
| 1.95993000000003e-05 | 86063988.405 | 102629513.018 | 119400580.587 |
| 1.96164500000003e-05 | 85803008.924 | 102312455.748 | 119026393.589 |
| 1.96336000000003e-05 | 85543008.997 | 101996613.571 | 118653663.478 |
| 1.96507500000003e-05 | 85283984.262 | 101681980.948 | 118282383.494 |
| 1.96679000000003e-05 | 85025930.378 | 101368552.365 | 117912546.911 |
| 1.96850500000003e-05 | 84768843.026 | 101056322.339 | 117544147.039 |
| 1.97022000000003e-05 | 84512717.911 | 100745285.418 | 117177177.227 |
| 1.97193500000003e-05 | 84257550.757 | 100435436.175 | 116811630.856 |
| 1.97365000000003e-05 | 84003337.313 | 100126769.214 | 116447501.345 |
| 1.97536500000003e-05 | 83750073.349 | 99819279.166 | 116084782.146 |
| 1.97708000000003e-05 | 83497754.654 | 99512960.69 | 115723466.747 |
| 1.97879500000003e-05 | 83246377.042 | 99207808.476 | 115363548.673 |
| 1.98051000000003e-05 | 82995936.347 | 98903817.237 | 115005021.48 |
| 1.98222500000003e-05 | 82746428.423 | 98600981.718 | 114647878.761 |
| 1.98394000000003e-05 | 82497849.146 | 98299296.689 | 114292114.142 |
| 1.98565500000003e-05 | 82250194.415 | 97998756.948 | 113937721.283 |
| 1.98737000000003e-05 | 82003460.147 | 97699357.32 | 113584693.878 |
| 1.98908500000003e-05 | 81757642.282 | 97401092.658 | 113233025.655 |
| 1.99080000000003e-05 | 81512736.777 | 97103957.841 | 112882710.375 |
| 1.99251500000003e-05 | 81268739.615 | 96807947.775 | 112533741.833 |
| 1.99423000000003e-05 | 81025646.794 | 96513057.392 | 112186113.854 |
| 1.99594500000003e-05 | 80783454.337 | 96219281.651 | 111839820.3 |
| 1.99766000000003e-05 | 80542158.283 | 95926615.538 | 111494855.063 |
| 1.99937500000003e-05 | 80301754.695 | 95635054.062 | 111151212.067 |
| 2.00109000000003e-05 | 80062239.652 | 95344592.262 | 110808885.27 |
| 2.00280500000003e-05 | 79823609.256 | 95055225.2 | 110467868.66 |
| 2.00452000000003e-05 | 79585859.627 | 94766947.965 | 110128156.26 |
| 2.00623500000003e-05 | 79348986.905 | 94479755.67 | 109789742.12 |
| 2.00795000000003e-05 | 79112987.25 | 94193643.456 | 109452620.326 |
| 2.00966500000003e-05 | 78877856.841 | 93908606.485 | 109116784.992 |
| 2.01138000000003e-05 | 78643591.876 | 93624639.949 | 108782230.264 |
| 2.01309500000003e-05 | 78410188.573 | 93341739.061 | 108448950.32 |
| 2.01481000000003e-05 | 78177643.167 | 93059899.061 | 108116939.367 |
| 2.01652500000003e-05 | 77945951.915 | 92779115.211 | 107786191.644 |
| 2.01824000000003e-05 | 77715111.091 | 92499382.801 | 107456701.419 |
| 2.01995500000003e-05 | 77485116.988 | 92220697.143 | 107128462.99 |
| 2.02167000000003e-05 | 77255965.918 | 91943053.573 | 106801470.687 |
| 2.02338500000003e-05 | 77027654.21 | 91666447.453 | 106475718.867 |
| 2.02510000000003e-05 | 76800178.213 | 91390874.166 | 106151201.919 |
| 2.02681500000003e-05 | 76573534.294 | 91116329.121 | 105827914.26 |
| 2.02853000000003e-05 | 76347718.838 | 90842807.751 | 105505850.337 |
| 2.03024500000003e-05 | 76122728.249 | 90570305.509 | 105185004.625 |
| 2.03196000000003e-05 | 75898558.948 | 90298817.876 | 104865371.629 |
| 2.03367500000003e-05 | 75675207.373 | 90028340.352 | 104546945.883 |
| 2.03539000000003e-05 | 75452669.982 | 89758868.464 | 104229721.948 |
| 2.03710500000003e-05 | 75230943.25 | 89490397.758 | 103913694.415 |
| 2.03882000000003e-05 | 75010023.668 | 89222923.806 | 103598857.902 |
| 2.04053500000003e-05 | 74789907.746 | 88956442.201 | 103285207.055 |
| 2.04225000000003e-05 | 74570592.011 | 88690948.559 | 102972736.55 |
| 2.04396500000003e-05 | 74352073.009 | 88426438.517 | 102661441.088 |
| 2.04568000000003e-05 | 74134347.3 | 88162907.738 | 102351315.398 |
| 2.04739500000003e-05 | 73917411.463 | 87900351.903 | 102042354.239 |
| 2.04911000000003e-05 | 73701262.095 | 87638766.717 | 101734552.395 |
| 2.05082500000003e-05 | 73485895.807 | 87378147.908 | 101427904.676 |
| 2.05254000000003e-05 | 73271309.23 | 87118491.222 | 101122405.921 |
| 2.05425500000003e-05 | 73057499.009 | 86859792.431 | 100818050.996 |
| 2.05597000000003e-05 | 72844461.807 | 86602047.325 | 100514834.792 |
| 2.05768500000003e-05 | 72632194.305 | 86345251.718 | 100212752.226 |
| 2.05940000000003e-05 | 72420693.197 | 86089401.445 | 99911798.244 |
| 2.06111500000003e-05 | 72209955.196 | 85834492.359 | 99611967.817 |
| 2.06283000000003e-05 | 71999977.031 | 85580520.339 | 99313255.939 |
| 2.06454500000003e-05 | 71790755.447 | 85327481.28 | 99015657.635 |
| 2.06626000000003e-05 | 71582287.203 | 85075371.101 | 98719167.952 |
| 2.06797500000003e-05 | 71374569.078 | 84824185.741 | 98423781.963 |
| 2.06969000000003e-05 | 71167597.863 | 84573921.159 | 98129494.767 |
| 2.07140500000003e-05 | 70961370.367 | 84324573.335 | 97836301.489 |
| 2.07312000000003e-05 | 70755883.414 | 84076138.269 | 97544197.278 |
| 2.07483500000003e-05 | 70551133.845 | 83828611.98 | 97253177.308 |
| 2.07655000000003e-05 | 70347118.515 | 83581990.51 | 96963236.777 |
| 2.07826500000003e-05 | 70143834.294 | 83336269.918 | 96674370.911 |
| 2.07998000000003e-05 | 69941278.07 | 83091446.284 | 96386574.955 |
| 2.08169500000003e-05 | 69739446.743 | 82847515.709 | 96099844.184 |
| 2.08341000000003e-05 | 69538337.23 | 82604474.312 | 95814173.893 |
| 2.08512500000003e-05 | 69337946.464 | 82362318.232 | 95529559.404 |
| 2.08684000000003e-05 | 69138271.392 | 82121043.626 | 95245996.06 |
| 2.08855500000003e-05 | 68939308.975 | 81880646.673 | 94963479.232 |
| 2.09027000000003e-05 | 68741056.19 | 81641123.57 | 94682004.31 |
| 2.09198500000003e-05 | 68543510.029 | 81402470.533 | 94401566.71 |
| 2.09370000000003e-05 | 68346667.499 | 81164683.796 | 94122161.872 |
| 2.09541500000003e-05 | 68150525.62 | 80927759.612 | 93843785.257 |
| 2.09713000000003e-05 | 67955081.428 | 80691694.256 | 93566432.351 |
| 2.09884500000003e-05 | 67760331.973 | 80456484.017 | 93290098.663 |
| 2.10056000000003e-05 | 67566274.32 | 80222125.205 | 93014779.723 |
| 2.10227500000003e-05 | 67372905.547 | 79988614.149 | 92740471.086 |
| 2.10399000000003e-05 | 67180222.747 | 79755947.195 | 92467168.328 |
| 2.10570500000003e-05 | 66988223.028 | 79524120.707 | 92194867.048 |
| 2.10742000000003e-05 | 66796903.51 | 79293131.068 | 91923562.868 |
| 2.10913500000003e-05 | 66606261.329 | 79062974.68 | 91653251.43 |
| 2.11085000000003e-05 | 66416293.634 | 78833647.96 | 91383928.401 |
| 2.11256500000003e-05 | 66226997.588 | 78605147.345 | 91115589.468 |
| 2.11428000000003e-05 | 66038370.369 | 78377469.29 | 90848230.34 |
| 2.11599500000003e-05 | 65850409.165 | 78150610.266 | 90581846.748 |
| 2.11771000000003e-05 | 65663111.182 | 77924566.762 | 90316434.445 |
| 2.11942500000003e-05 | 65476473.638 | 77699335.286 | 90051989.206 |
| 2.12114000000003e-05 | 65290493.762 | 77474912.362 | 89788506.824 |
| 2.12285500000003e-05 | 65105168.801 | 77251294.53 | 89525983.118 |
| 2.12457000000003e-05 | 64920496.011 | 77028478.35 | 89264413.924 |
| 2.12628500000003e-05 | 64736472.664 | 76806460.396 | 89003795.101 |
| 2.12800000000003e-05 | 64553096.045 | 76585237.262 | 88744122.528 |
| 2.12971500000003e-05 | 64370363.45 | 76364805.556 | 88485392.106 |
| 2.13143000000003e-05 | 64188272.19 | 76145161.904 | 88227599.756 |
| 2.13314500000003e-05 | 64006819.588 | 75926302.95 | 87970741.418 |
| 2.13486000000003e-05 | 63826002.982 | 75708225.352 | 87714813.054 |
| 2.13657500000003e-05 | 63645819.72 | 75490925.786 | 87459810.646 |
| 2.13829000000003e-05 | 63466267.163 | 75274400.944 | 87205730.196 |
| 2.14000500000003e-05 | 63287342.687 | 75058647.534 | 86952567.727 |
| 2.14172000000003e-05 | 63109043.679 | 74843662.281 | 86700319.278 |
| 2.14343500000003e-05 | 62931367.539 | 74629441.926 | 86448980.914 |
| 2.14515000000003e-05 | 62754311.679 | 74415983.225 | 86198548.714 |
| 2.14686500000003e-05 | 62577873.523 | 74203282.95 | 85949018.78 |
| 2.14858000000003e-05 | 62402050.508 | 73991337.891 | 85700387.232 |
| 2.15029500000003e-05 | 62226840.085 | 73780144.851 | 85452650.21 |
| 2.15201000000003e-05 | 62052239.714 | 73569700.65 | 85205803.873 |
| 2.15372500000003e-05 | 61878246.869 | 73360002.124 | 84959844.399 |
| 2.15544000000003e-05 | 61704859.036 | 73151046.123 | 84714767.985 |
| 2.15715500000003e-05 | 61532073.712 | 72942829.514 | 84470570.848 |
| 2.15887000000003e-05 | 61359888.408 | 72735349.177 | 84227249.221 |
| 2.16058500000003e-05 | 61188300.645 | 72528602.011 | 83984799.358 |
| 2.16230000000003e-05 | 61017307.956 | 72322584.927 | 83743217.533 |
| 2.16401500000003e-05 | 60846907.887 | 72117294.852 | 83502500.034 |
| 2.16573000000003e-05 | 60677097.995 | 71912728.727 | 83262643.172 |
| 2.16744500000003e-05 | 60507875.847 | 71708883.511 | 83023643.273 |
| 2.16916000000003e-05 | 60339239.025 | 71505756.174 | 82785496.684 |
| 2.17087500000003e-05 | 60171185.119 | 71303343.703 | 82548199.766 |
| 2.17259000000003e-05 | 60003711.734 | 71101643.099 | 82311748.903 |
| 2.17430500000003e-05 | 59836816.483 | 70900651.378 | 82076140.494 |
| 2.17602000000003e-05 | 59670496.991 | 70700365.57 | 81841370.955 |
| 2.17773500000003e-05 | 59504750.897 | 70500782.719 | 81607436.721 |
| 2.17945000000003e-05 | 59339575.849 | 70301899.884 | 81374334.246 |
| 2.18116500000003e-05 | 59174969.505 | 70103714.139 | 81142059.998 |
| 2.18288000000003e-05 | 59010929.536 | 69906222.571 | 80910610.465 |
| 2.18459500000003e-05 | 58847453.624 | 69709422.281 | 80679982.152 |
| 2.18631000000003e-05 | 58684539.462 | 69513310.384 | 80450171.581 |
| 2.18802500000003e-05 | 58522184.752 | 69317884.011 | 80221175.289 |
| 2.18974000000003e-05 | 58360387.208 | 69123140.303 | 79992989.834 |
| 2.19145500000003e-05 | 58199144.557 | 68929076.419 | 79765611.787 |
| 2.19317000000003e-05 | 58038454.533 | 68735689.529 | 79539037.738 |
| 2.19488500000003e-05 | 57878314.883 | 68542976.817 | 79313264.295 |
| 2.19660000000003e-05 | 57718723.364 | 68350935.481 | 79088288.078 |
| 2.19831500000003e-05 | 57559677.744 | 68159562.734 | 78864105.728 |
| 2.20003000000003e-05 | 57401175.8 | 67968855.798 | 78640713.901 |
| 2.20174500000003e-05 | 57243215.322 | 67778811.913 | 78418109.269 |
| 2.20346000000003e-05 | 57085794.108 | 67589428.331 | 78196288.52 |
| 2.20517500000003e-05 | 56928909.967 | 67400702.315 | 77975248.359 |
| 2.20689000000003e-05 | 56772560.72 | 67212631.144 | 77754985.506 |
| 2.20860500000003e-05 | 56616744.195 | 67025212.108 | 77535496.698 |
| 2.21032000000003e-05 | 56461458.234 | 66838442.512 | 77316778.688 |
| 2.21203500000003e-05 | 56306700.685 | 66652319.671 | 77098828.243 |
| 2.21375000000003e-05 | 56152469.41 | 66466840.917 | 76881642.149 |
| 2.21546500000003e-05 | 55998762.278 | 66282003.59 | 76665217.205 |
| 2.21718000000003e-05 | 55845577.17 | 66097805.046 | 76449550.225 |
| 2.21889500000003e-05 | 55692911.975 | 65914242.652 | 76234638.041 |
| 2.22061000000003e-05 | 55540764.594 | 65731313.79 | 76020477.499 |
| 2.22232500000003e-05 | 55389132.936 | 65549015.851 | 75807065.46 |
| 2.22404000000003e-05 | 55238014.921 | 65367346.242 | 75594398.8 |
| 2.22575500000003e-05 | 55087408.478 | 65186302.378 | 75382474.412 |
| 2.22747000000003e-05 | 54937311.546 | 65005881.691 | 75171289.202 |
| 2.22918500000003e-05 | 54787722.073 | 64826081.622 | 74960840.092 |
| 2.23090000000003e-05 | 54638638.017 | 64646899.626 | 74751124.018 |
| 2.23261500000003e-05 | 54490057.346 | 64468333.169 | 74542137.931 |
| 2.23433000000003e-05 | 54341978.036 | 64290379.729 | 74333878.799 |
| 2.23604500000003e-05 | 54194398.074 | 64113036.796 | 74126343.601 |
| 2.23776000000003e-05 | 54047315.456 | 63936301.874 | 73919529.333 |
| 2.23947500000003e-05 | 53900728.187 | 63760172.476 | 73713433.004 |
| 2.24119000000003e-05 | 53754634.28 | 63584646.127 | 73508051.639 |
| 2.24290500000003e-05 | 53609031.759 | 63409720.366 | 73303382.276 |
| 2.24462000000003e-05 | 53463918.658 | 63235392.742 | 73099421.968 |
| 2.24633500000003e-05 | 53319293.017 | 63061660.815 | 72896167.781 |
| 2.24805000000003e-05 | 53175152.887 | 62888522.158 | 72693616.797 |
| 2.24976500000003e-05 | 53031496.328 | 62715974.354 | 72491766.11 |
| 2.25148000000003e-05 | 52888321.409 | 62544015 | 72290612.829 |
| 2.25319500000003e-05 | 52745626.208 | 62372641.701 | 72090154.077 |
| 2.25491000000003e-05 | 52603408.81 | 62201852.075 | 71890386.991 |
| 2.25662500000003e-05 | 52461667.312 | 62031643.751 | 71691308.72 |
| 2.25834000000003e-05 | 52320399.818 | 61862014.37 | 71492916.428 |
| 2.26005500000003e-05 | 52179604.439 | 61692961.583 | 71295207.293 |
| 2.26177000000003e-05 | 52039279.299 | 61524483.053 | 71098178.506 |
| 2.26348500000003e-05 | 51899422.526 | 61356576.451 | 70901827.27 |
| 2.26520000000004e-05 | 51760032.261 | 61189239.464 | 70706150.803 |
| 2.26691500000004e-05 | 51621106.65 | 61022469.786 | 70511146.337 |
| 2.26863000000003e-05 | 51482643.848 | 60856265.122 | 70316811.115 |
| 2.27034500000003e-05 | 51344642.021 | 60690623.191 | 70123142.394 |
| 2.27206000000004e-05 | 51207099.342 | 60525541.718 | 69930137.444 |
| 2.27377500000004e-05 | 51070013.99 | 60361018.442 | 69737793.549 |
| 2.27549000000004e-05 | 50933384.156 | 60197051.112 | 69546108.005 |
| 2.27720500000003e-05 | 50797208.038 | 60033637.487 | 69355078.12 |
| 2.27892000000004e-05 | 50661483.841 | 59870775.336 | 69164701.216 |
| 2.28063500000004e-05 | 50526209.779 | 59708462.44 | 68974974.628 |
| 2.28235000000004e-05 | 50391384.075 | 59546696.589 | 68785895.703 |
| 2.28406500000004e-05 | 50257004.96 | 59385475.582 | 68597461.8 |
| 2.28578000000004e-05 | 50123070.672 | 59224797.233 | 68409670.291 |
| 2.28749500000004e-05 | 49989579.457 | 59064659.361 | 68222518.56 |
| 2.28921000000004e-05 | 49856529.57 | 58905059.797 | 68036004.005 |
| 2.29092500000004e-05 | 49723919.274 | 58745996.384 | 67850124.035 |
| 2.29264000000004e-05 | 49591746.839 | 58587466.973 | 67664876.071 |
| 2.29435500000004e-05 | 49460010.544 | 58429469.424 | 67480257.546 |
| 2.29607000000004e-05 | 49328708.674 | 58272001.609 | 67296265.907 |
| 2.29778500000004e-05 | 49197839.523 | 58115061.41 | 67112898.61 |
| 2.29950000000004e-05 | 49067401.394 | 57958646.717 | 66930153.125 |
| 2.30121500000004e-05 | 48937392.595 | 57802755.431 | 66748026.935 |
| 2.30293000000004e-05 | 48807811.443 | 57647385.463 | 66566517.532 |
| 2.30464500000004e-05 | 48678656.264 | 57492534.733 | 66385622.421 |
| 2.30636000000004e-05 | 48549925.39 | 57338201.17 | 66205339.119 |
| 2.30807500000004e-05 | 48421617.16 | 57184382.714 | 66025665.156 |
| 2.30979000000004e-05 | 48293729.922 | 57031077.313 | 65846598.07 |
| 2.31150500000004e-05 | 48166262.03 | 56878282.927 | 65668135.414 |
| 2.31322000000004e-05 | 48039211.848 | 56725997.523 | 65490274.75 |
| 2.31493500000004e-05 | 47912577.744 | 56574219.077 | 65313013.653 |
| 2.31665000000004e-05 | 47786358.095 | 56422945.577 | 65136349.71 |
| 2.31836500000004e-05 | 47660551.287 | 56272175.018 | 64960280.516 |
| 2.32008000000004e-05 | 47535155.71 | 56121905.404 | 64784803.681 |
| 2.32179500000004e-05 | 47410169.763 | 55972134.751 | 64609916.824 |
| 2.32351000000004e-05 | 47285591.854 | 55822861.082 | 64435617.575 |
| 2.32522500000004e-05 | 47161420.394 | 55674082.428 | 64261903.577 |
| 2.32694000000004e-05 | 47037653.804 | 55525796.831 | 64088772.481 |
| 2.32865500000004e-05 | 46914290.513 | 55378002.341 | 63916221.952 |
| 2.33037000000004e-05 | 46791328.953 | 55230697.018 | 63744249.664 |
| 2.33208500000004e-05 | 46668767.568 | 55083878.93 | 63572853.302 |
| 2.33380000000004e-05 | 46546604.806 | 54937546.153 | 63402030.562 |
| 2.33551500000004e-05 | 46424839.122 | 54791696.774 | 63231779.152 |
| 2.33723000000004e-05 | 46303468.978 | 54646328.887 | 63062096.787 |
| 2.33894500000004e-05 | 46182492.845 | 54501440.596 | 62892981.197 |
| 2.34066000000004e-05 | 46061909.198 | 54357030.012 | 62724430.119 |
| 2.34237500000004e-05 | 45941716.521 | 54213095.256 | 62556441.304 |
| 2.34409000000004e-05 | 45821913.303 | 54069634.457 | 62389012.509 |
| 2.34580500000004e-05 | 45702498.041 | 53926645.753 | 62222141.505 |
| 2.34752000000004e-05 | 45583469.238 | 53784127.29 | 62055826.072 |
| 2.34923500000004e-05 | 45464825.404 | 53642077.222 | 61890064.001 |
| 2.35095000000004e-05 | 45346565.057 | 53500493.713 | 61724853.091 |
| 2.35266500000004e-05 | 45228686.718 | 53359374.933 | 61560191.154 |
| 2.35438000000004e-05 | 45111188.919 | 53218719.063 | 61396076.01 |
| 2.35609500000004e-05 | 44994070.194 | 53078524.29 | 61232505.49 |
| 2.35781000000004e-05 | 44877329.089 | 52938788.811 | 61069477.435 |
| 2.35952500000004e-05 | 44760964.15 | 52799510.829 | 60906989.696 |
| 2.36124000000004e-05 | 44644973.936 | 52660688.558 | 60745040.132 |
| 2.36295500000004e-05 | 44529357.007 | 52522320.217 | 60583626.616 |
| 2.36467000000004e-05 | 44414111.932 | 52384404.036 | 60422747.027 |
| 2.36638500000004e-05 | 44299237.287 | 52246938.251 | 60262399.255 |
| 2.36810000000004e-05 | 44184731.653 | 52109921.107 | 60102581.199 |
| 2.36981500000004e-05 | 44070593.617 | 51973350.856 | 59943290.769 |
| 2.37153000000004e-05 | 43956821.773 | 51837225.759 | 59784525.885 |
| 2.37324500000004e-05 | 43843414.722 | 51701544.084 | 59626284.473 |
| 2.37496000000004e-05 | 43730371.069 | 51566304.107 | 59468564.473 |
| 2.37667500000004e-05 | 43617689.427 | 51431504.112 | 59311363.831 |
| 2.37839000000004e-05 | 43505368.414 | 51297142.39 | 59154680.504 |
| 2.38010500000004e-05 | 43393406.656 | 51163217.242 | 58998512.459 |
| 2.38182000000004e-05 | 43281802.783 | 51029726.973 | 58842857.671 |
| 2.38353500000004e-05 | 43170555.432 | 50896669.899 | 58687714.123 |
| 2.38525000000004e-05 | 43059663.245 | 50764044.341 | 58533079.811 |
| 2.38696500000004e-05 | 42949124.872 | 50631848.63 | 58378952.736 |
| 2.38868000000004e-05 | 42838938.967 | 50500081.102 | 58225330.912 |
| 2.39039500000004e-05 | 42729104.191 | 50368740.103 | 58072212.358 |
| 2.39211000000004e-05 | 42619619.21 | 50237823.983 | 57919595.105 |
| 2.39382500000004e-05 | 42510482.697 | 50107331.103 | 57767477.192 |
| 2.39554000000004e-05 | 42401693.33 | 49977259.83 | 57615856.667 |
| 2.39725500000004e-05 | 42293249.793 | 49847608.537 | 57464731.587 |
| 2.39897000000004e-05 | 42185150.775 | 49718375.607 | 57314100.017 |
| 2.40068500000004e-05 | 42077394.974 | 49589559.427 | 57163960.031 |
| 2.40240000000004e-05 | 41969981.089 | 49461158.393 | 57014309.714 |
| 2.40411500000004e-05 | 41862907.828 | 49333170.909 | 56865147.155 |
| 2.40583000000004e-05 | 41756173.903 | 49205595.384 | 56716470.457 |
| 2.40754500000004e-05 | 41649778.033 | 49078430.236 | 56568277.728 |
| 2.40926000000004e-05 | 41543718.941 | 48951673.889 | 56420567.085 |
| 2.41097500000004e-05 | 41437995.358 | 48825324.774 | 56273336.654 |
| 2.41269000000004e-05 | 41332606.017 | 48699381.33 | 56126584.57 |
| 2.41440500000004e-05 | 41227549.66 | 48573842.001 | 55980308.977 |
| 2.41612000000004e-05 | 41122825.033 | 48448705.24 | 55834508.024 |
| 2.41783500000004e-05 | 41018430.886 | 48323969.506 | 55689179.872 |
| 2.41955000000004e-05 | 40914365.978 | 48199633.265 | 55544322.689 |
| 2.42126500000004e-05 | 40810629.07 | 48075694.989 | 55399934.651 |
| 2.42298000000004e-05 | 40707218.93 | 47952153.158 | 55256013.943 |
| 2.42469500000004e-05 | 40604134.332 | 47829006.257 | 55112558.756 |
| 2.42641000000004e-05 | 40501374.053 | 47706252.78 | 54969567.291 |
| 2.42812500000004e-05 | 40398936.877 | 47583891.227 | 54827037.757 |
| 2.42984000000004e-05 | 40296821.594 | 47461920.103 | 54684968.372 |
| 2.43155500000004e-05 | 40195026.997 | 47340337.921 | 54543357.359 |
| 2.43327000000004e-05 | 40093551.887 | 47219143.201 | 54402202.951 |
| 2.43498500000004e-05 | 39992395.068 | 47098334.468 | 54261503.39 |
| 2.43670000000004e-05 | 39891555.349 | 46977910.255 | 54121256.923 |
| 2.43841500000004e-05 | 39791031.546 | 46857869.101 | 53981461.807 |
| 2.44013000000004e-05 | 39690822.48 | 46738209.551 | 53842116.305 |
| 2.44184500000004e-05 | 39590926.974 | 46618930.157 | 53703218.691 |
| 2.44356000000004e-05 | 39491343.861 | 46500029.477 | 53564767.243 |
| 2.44527500000004e-05 | 39392071.974 | 46381506.075 | 53426760.248 |
| 2.44699000000004e-05 | 39293110.155 | 46263358.522 | 53289196.002 |
| 2.44870500000004e-05 | 39194457.249 | 46145585.395 | 53152072.807 |
| 2.45042000000004e-05 | 39096112.106 | 46028185.278 | 53015388.974 |
| 2.45213500000004e-05 | 38998073.582 | 45911156.759 | 52879142.819 |
| 2.45385000000004e-05 | 38900340.538 | 45794498.436 | 52743332.668 |
| 2.45556500000004e-05 | 38802911.837 | 45678208.908 | 52607956.853 |
| 2.45728000000004e-05 | 38705786.351 | 45562286.785 | 52473013.714 |
| 2.45899500000004e-05 | 38608962.954 | 45446730.681 | 52338501.599 |
| 2.46071000000004e-05 | 38512440.526 | 45331539.216 | 52204418.862 |
| 2.46242500000004e-05 | 38416217.952 | 45216711.015 | 52070763.865 |
| 2.46414000000004e-05 | 38320294.122 | 45102244.712 | 51937534.977 |
| 2.46585500000004e-05 | 38224667.928 | 44988138.943 | 51804730.575 |
| 2.46757000000004e-05 | 38129338.271 | 44874392.354 | 51672349.042 |
| 2.46928500000004e-05 | 38034304.053 | 44761003.595 | 51540388.77 |
| 2.47100000000004e-05 | 37939564.184 | 44647971.321 | 51408848.155 |
| 2.47271500000004e-05 | 37845117.576 | 44535294.193 | 51277725.602 |
| 2.47443000000004e-05 | 37750963.146 | 44422970.881 | 51147019.525 |
| 2.47614500000004e-05 | 37657099.818 | 44311000.056 | 51016728.341 |
| 2.47786000000004e-05 | 37563526.517 | 44199380.399 | 50886850.476 |
| 2.47957500000004e-05 | 37470242.176 | 44088110.594 | 50757384.365 |
| 2.48129000000004e-05 | 37377245.73 | 43977189.332 | 50628328.445 |
| 2.48300500000004e-05 | 37284536.12 | 43866615.309 | 50499681.165 |
| 2.48472000000004e-05 | 37192112.29 | 43756387.227 | 50371440.977 |
| 2.48643500000004e-05 | 37099973.192 | 43646503.793 | 50243606.341 |
| 2.48815000000004e-05 | 37008117.778 | 43536963.722 | 50116175.726 |
| 2.48986500000004e-05 | 36916545.007 | 43427765.731 | 49989147.604 |
| 2.49158000000004e-05 | 36825253.842 | 43318908.546 | 49862520.457 |
| 2.49329500000004e-05 | 36734243.25 | 43210390.895 | 49736292.77 |
| 2.49501000000004e-05 | 36643512.203 | 43102211.514 | 49610463.039 |
| 2.49672500000004e-05 | 36553059.677 | 42994369.145 | 49485029.763 |
| 2.49844000000004e-05 | 36462884.653 | 42886862.533 | 49359991.449 |
| 2.50015500000004e-05 | 36372986.115 | 42779690.429 | 49235346.611 |
| 2.50187000000004e-05 | 36283363.053 | 42672851.592 | 49111093.769 |
| 2.50358500000004e-05 | 36194014.459 | 42566344.784 | 48987231.449 |
| 2.50530000000004e-05 | 36104939.331 | 42460168.771 | 48863758.185 |
| 2.50701500000004e-05 | 36016136.672 | 42354322.328 | 48740672.515 |
| 2.50873000000004e-05 | 35927605.486 | 42248804.232 | 48617972.985 |
| 2.51044500000004e-05 | 35839344.785 | 42143613.268 | 48495658.147 |
| 2.51216000000004e-05 | 35751353.583 | 42038748.223 | 48373726.559 |
| 2.51387500000004e-05 | 35663630.898 | 41934207.893 | 48252176.786 |
| 2.51559000000004e-05 | 35576175.754 | 41829991.075 | 48131007.399 |
| 2.51730500000004e-05 | 35488987.177 | 41726096.576 | 48010216.975 |
| 2.51902000000004e-05 | 35402064.197 | 41622523.203 | 47889804.097 |
| 2.52073500000004e-05 | 35315405.851 | 41519269.772 | 47769767.355 |
| 2.52245000000004e-05 | 35229011.177 | 41416335.103 | 47650105.343 |
| 2.52416500000004e-05 | 35142879.219 | 41313718.02 | 47530816.664 |
| 2.52588000000004e-05 | 35057009.023 | 41211417.352 | 47411899.925 |
| 2.52759500000004e-05 | 34971399.64 | 41109431.935 | 47293353.74 |
| 2.52931000000004e-05 | 34886050.127 | 41007760.608 | 47175176.728 |
| 2.53102500000004e-05 | 34800959.542 | 40906402.217 | 47057367.516 |
| 2.53274000000004e-05 | 34716126.948 | 40805355.61 | 46939924.735 |
| 2.53445500000004e-05 | 34631551.412 | 40704619.642 | 46822847.022 |
| 2.53617000000004e-05 | 34547232.005 | 40604193.173 | 46706133.021 |
| 2.53788500000004e-05 | 34463167.802 | 40504075.066 | 46589781.381 |
| 2.53960000000004e-05 | 34379357.881 | 40404264.192 | 46473790.758 |
| 2.54131500000004e-05 | 34295801.326 | 40304759.424 | 46358159.811 |
| 2.54303000000004e-05 | 34212497.222 | 40205559.64 | 46242887.208 |
| 2.54474500000004e-05 | 34129444.66 | 40106663.725 | 46127971.622 |
| 2.54646000000004e-05 | 34046642.734 | 40008070.566 | 46013411.73 |
| 2.54817500000004e-05 | 33964090.541 | 39909779.056 | 45899206.215 |
| 2.54989000000004e-05 | 33881787.183 | 39811788.094 | 45785353.769 |
| 2.55160500000004e-05 | 33799731.766 | 39714096.58 | 45671853.085 |
| 2.55332000000004e-05 | 33717923.398 | 39616703.423 | 45558702.865 |
| 2.55503500000004e-05 | 33636361.192 | 39519607.534 | 45445901.815 |
| 2.55675000000004e-05 | 33555044.264 | 39422807.83 | 45333448.646 |
| 2.55846500000004e-05 | 33473971.735 | 39326303.23 | 45221342.076 |
| 2.56018000000004e-05 | 33393142.729 | 39230092.661 | 45109580.828 |
| 2.56189500000004e-05 | 33312556.372 | 39134175.052 | 44998163.631 |
| 2.56361000000004e-05 | 33232211.796 | 39038549.338 | 44887089.217 |
| 2.56532500000004e-05 | 33152108.136 | 38943214.457 | 44776356.326 |
| 2.56704000000004e-05 | 33072244.529 | 38848169.354 | 44665963.703 |
| 2.56875500000004e-05 | 32992620.117 | 38753412.976 | 44555910.097 |
| 2.57047000000004e-05 | 32913234.047 | 38658944.274 | 44446194.265 |
| 2.57218500000004e-05 | 32834085.466 | 38564762.207 | 44336814.966 |
| 2.57390000000004e-05 | 32755173.527 | 38470865.736 | 44227770.966 |
| 2.57561500000004e-05 | 32676497.386 | 38377253.825 | 44119061.037 |
| 2.57733000000004e-05 | 32598056.203 | 38283925.444 | 44010683.954 |
| 2.57904500000004e-05 | 32519849.14 | 38190879.568 | 43902638.5 |
| 2.58076000000004e-05 | 32441875.364 | 38098115.175 | 43794923.461 |
| 2.58247500000004e-05 | 32364134.044 | 38005631.248 | 43687537.629 |
| 2.58419000000004e-05 | 32286624.354 | 37913426.774 | 43580479.802 |
| 2.58590500000004e-05 | 32209345.47 | 37821500.744 | 43473748.78 |
| 2.58762000000004e-05 | 32132296.572 | 37729852.154 | 43367343.372 |
| 2.58933500000004e-05 | 32055476.844 | 37638480.003 | 43261262.39 |
| 2.59105000000004e-05 | 31978885.472 | 37547383.296 | 43155504.651 |
| 2.59276500000004e-05 | 31902521.647 | 37456561.04 | 43050068.978 |
| 2.59448000000004e-05 | 31826384.562 | 37366012.247 | 42944954.197 |
| 2.59619500000004e-05 | 31750473.414 | 37275735.935 | 42840159.141 |
| 2.59791000000004e-05 | 31674787.402 | 37185731.123 | 42735682.648 |
| 2.59962500000004e-05 | 31599325.73 | 37095996.836 | 42631523.559 |
| 2.60134000000004e-05 | 31524087.605 | 37006532.103 | 42527680.721 |
| 2.60305500000004e-05 | 31449072.237 | 36917335.956 | 42424152.987 |
| 2.60477000000004e-05 | 31374278.838 | 36828407.432 | 42320939.213 |
| 2.60648500000004e-05 | 31299706.625 | 36739745.571 | 42218038.261 |
| 2.60820000000004e-05 | 31225354.817 | 36651349.419 | 42115448.997 |
| 2.60991500000004e-05 | 31151222.638 | 36563218.023 | 42013170.292 |
| 2.61163000000004e-05 | 31077309.312 | 36475350.438 | 41911201.022 |
| 2.61334500000004e-05 | 31003614.07 | 36387745.718 | 41809540.067 |
| 2.61506000000004e-05 | 30930136.142 | 36300402.925 | 41708186.314 |
| 2.61677500000004e-05 | 30856874.766 | 36213321.124 | 41607138.652 |
| 2.61849000000004e-05 | 30783829.178 | 36126499.381 | 41506395.976 |
| 2.62020500000004e-05 | 30710998.621 | 36039936.77 | 41405957.184 |
| 2.62192000000004e-05 | 30638382.339 | 35953632.367 | 41305821.181 |
| 2.62363500000004e-05 | 30565979.58 | 35867585.25 | 41205986.876 |
| 2.62535000000004e-05 | 30493789.595 | 35781794.504 | 41106453.182 |
| 2.62706500000004e-05 | 30421811.637 | 35696259.217 | 41007219.015 |
| 2.62878000000004e-05 | 30350044.964 | 35610978.478 | 40908283.299 |
| 2.63049500000004e-05 | 30278488.835 | 35525951.384 | 40809644.96 |
| 2.63221000000004e-05 | 30207142.513 | 35441177.033 | 40711302.929 |
| 2.63392500000004e-05 | 30136005.264 | 35356654.527 | 40613256.142 |
| 2.63564000000004e-05 | 30065076.358 | 35272382.973 | 40515503.539 |
| 2.63735500000004e-05 | 29994355.065 | 35188361.479 | 40418044.065 |
| 2.63907000000004e-05 | 29923840.661 | 35104589.16 | 40320876.667 |
| 2.64078500000004e-05 | 29853532.423 | 35021065.133 | 40224000.301 |
| 2.64250000000004e-05 | 29783429.632 | 34937788.518 | 40127413.922 |
| 2.64421500000004e-05 | 29713531.572 | 34854758.439 | 40031116.494 |
| 2.64593000000004e-05 | 29643837.528 | 34771974.025 | 39935106.982 |
| 2.64764500000004e-05 | 29574346.791 | 34689434.407 | 39839384.358 |
| 2.64936000000004e-05 | 29505058.653 | 34607138.72 | 39743947.595 |
| 2.65107500000004e-05 | 29435972.408 | 34525086.103 | 39648795.674 |
| 2.65279000000004e-05 | 29367087.354 | 34443275.698 | 39553927.577 |
| 2.65450500000004e-05 | 29298402.793 | 34361706.651 | 39459342.292 |
| 2.65622000000004e-05 | 29229918.027 | 34280378.11 | 39365038.811 |
| 2.65793500000004e-05 | 29161632.364 | 34199289.228 | 39271016.13 |
| 2.65965000000004e-05 | 29093545.112 | 34118439.162 | 39177273.248 |
| 2.66136500000004e-05 | 29025655.583 | 34037827.072 | 39083809.171 |
| 2.66308000000004e-05 | 28957963.092 | 33957452.119 | 38990622.907 |
| 2.66479500000004e-05 | 28890466.957 | 33877313.471 | 38897713.468 |
| 2.66651000000004e-05 | 28823166.497 | 33797410.297 | 38805079.87 |
| 2.66822500000004e-05 | 28756061.036 | 33717741.77 | 38712721.135 |
| 2.66994000000004e-05 | 28689149.899 | 33638307.068 | 38620636.286 |
| 2.67165500000004e-05 | 28622432.415 | 33559105.37 | 38528824.353 |
| 2.67337000000004e-05 | 28555907.914 | 33480135.859 | 38437284.369 |
| 2.67508500000004e-05 | 28489575.73 | 33401397.722 | 38346015.369 |
| 2.67680000000004e-05 | 28423435.201 | 33322890.149 | 38255016.396 |
| 2.67851500000004e-05 | 28357485.664 | 33244612.333 | 38164286.492 |
| 2.68023000000004e-05 | 28291726.461 | 33166563.471 | 38073824.707 |
| 2.68194500000004e-05 | 28226156.937 | 33088742.762 | 37983630.093 |
| 2.68366000000004e-05 | 28160776.439 | 33011149.409 | 37893701.707 |
| 2.68537500000004e-05 | 28095584.317 | 32933782.619 | 37804038.609 |
| 2.68709000000004e-05 | 28030579.922 | 32856641.601 | 37714639.862 |
| 2.68880500000004e-05 | 27965762.609 | 32779725.567 | 37625504.535 |
| 2.69052000000004e-05 | 27901131.735 | 32703033.735 | 37536631.699 |
| 2.69223500000004e-05 | 27836686.661 | 32626565.321 | 37448020.43 |
| 2.69395000000004e-05 | 27772426.749 | 32550319.55 | 37359669.807 |
| 2.69566500000004e-05 | 27708351.363 | 32474295.645 | 37271578.914 |
| 2.69738000000004e-05 | 27644459.872 | 32398492.836 | 37183746.837 |
| 2.69909500000004e-05 | 27580751.645 | 32322910.354 | 37096172.666 |
| 2.70081000000004e-05 | 27517226.054 | 32247547.434 | 37008855.496 |
| 2.70252500000004e-05 | 27453882.475 | 32172403.313 | 36921794.425 |
| 2.70424000000004e-05 | 27390720.286 | 32097477.232 | 36834988.555 |
| 2.70595500000004e-05 | 27327738.865 | 32022768.436 | 36748436.99 |
| 2.70767000000004e-05 | 27264937.597 | 31948276.171 | 36662138.841 |
| 2.70938500000004e-05 | 27202315.864 | 31873999.688 | 36576093.218 |
| 2.71110000000004e-05 | 27139873.055 | 31799938.238 | 36490299.24 |
| 2.71281500000004e-05 | 27077608.56 | 31726091.078 | 36404756.024 |
| 2.71453000000004e-05 | 27015521.77 | 31652457.468 | 36319462.695 |
| 2.71624500000004e-05 | 26953612.08 | 31579036.669 | 36234418.38 |
| 2.71796000000004e-05 | 26891878.887 | 31505827.946 | 36149622.209 |
| 2.71967500000004e-05 | 26830321.591 | 31432830.566 | 36065073.317 |
| 2.72139000000004e-05 | 26768939.592 | 31360043.802 | 35980770.84 |
| 2.72310500000004e-05 | 26707732.295 | 31287466.925 | 35896713.92 |
| 2.72482000000004e-05 | 26646699.107 | 31215099.214 | 35812901.701 |
| 2.72653500000004e-05 | 26585839.436 | 31142939.948 | 35729333.331 |
| 2.72825000000004e-05 | 26525152.693 | 31070988.408 | 35646007.962 |
| 2.72996500000004e-05 | 26464638.292 | 30999243.881 | 35562924.748 |
| 2.73168000000004e-05 | 26404295.647 | 30927705.654 | 35480082.848 |
| 2.73339500000004e-05 | 26344124.179 | 30856373.019 | 35397481.423 |
| 2.73511000000004e-05 | 26284123.305 | 30785245.269 | 35315119.639 |
| 2.73682500000004e-05 | 26224292.45 | 30714321.701 | 35232996.664 |
| 2.73854000000004e-05 | 26164631.037 | 30643601.614 | 35151111.669 |
| 2.74025500000004e-05 | 26105138.495 | 30573084.311 | 35069463.831 |
| 2.74197000000004e-05 | 26045814.252 | 30502769.097 | 34988052.326 |
| 2.74368500000004e-05 | 25986657.74 | 30432655.279 | 34906876.338 |
| 2.74540000000004e-05 | 25927668.392 | 30362742.168 | 34825935.051 |
| 2.74711500000004e-05 | 25868845.645 | 30293029.077 | 34745227.653 |
| 2.74883000000004e-05 | 25810188.937 | 30223515.322 | 34664753.336 |
| 2.75054500000004e-05 | 25751697.708 | 30154200.222 | 34584511.295 |
| 2.75226000000004e-05 | 25693371.401 | 30085083.099 | 34504500.727 |
| 2.75397500000004e-05 | 25635209.461 | 30016163.276 | 34424720.835 |
| 2.75569000000004e-05 | 25577211.334 | 29947440.081 | 34345170.823 |
| 2.75740500000004e-05 | 25519376.47 | 29878912.842 | 34265849.898 |
| 2.75912000000004e-05 | 25461704.32 | 29810580.892 | 34186757.271 |
| 2.76083500000004e-05 | 25404194.338 | 29742443.566 | 34107892.157 |
| 2.76255000000004e-05 | 25346845.978 | 29674500.201 | 34029253.772 |
| 2.76426500000004e-05 | 25289658.699 | 29606750.137 | 33950841.336 |
| 2.76598000000004e-05 | 25232631.961 | 29539192.716 | 33872654.074 |
| 2.76769500000004e-05 | 25175765.224 | 29471827.285 | 33794691.212 |
| 2.76941000000004e-05 | 25119057.954 | 29404653.19 | 33716951.979 |
| 2.77112500000004e-05 | 25062509.616 | 29337669.783 | 33639435.607 |
| 2.77284000000004e-05 | 25006119.678 | 29270876.416 | 33562141.334 |
| 2.77455500000004e-05 | 24949887.61 | 29204272.444 | 33485068.397 |
| 2.77627000000005e-05 | 24893812.886 | 29137857.227 | 33408216.038 |
| 2.77798500000004e-05 | 24837894.978 | 29071630.123 | 33331583.503 |
| 2.77970000000004e-05 | 24782133.364 | 29005590.497 | 33255170.039 |
| 2.78141500000004e-05 | 24726527.522 | 28939737.714 | 33178974.896 |
| 2.78313000000005e-05 | 24671076.931 | 28874071.141 | 33102997.33 |
| 2.78484500000005e-05 | 24615781.075 | 28808590.151 | 33027236.596 |
| 2.78656000000004e-05 | 24560639.438 | 28743294.115 | 32951691.954 |
| 2.78827500000005e-05 | 24505651.506 | 28678182.409 | 32876362.667 |
| 2.78999000000005e-05 | 24450816.768 | 28613254.412 | 32801248 |
| 2.79170500000005e-05 | 24396134.714 | 28548509.503 | 32726347.223 |
| 2.79342000000004e-05 | 24341604.835 | 28483947.065 | 32651659.606 |
| 2.79513500000005e-05 | 24287226.628 | 28419566.484 | 32577184.424 |
| 2.79685000000005e-05 | 24232999.587 | 28355367.147 | 32502920.955 |
| 2.79856500000005e-05 | 24178923.211 | 28291348.444 | 32428868.477 |
| 2.80028000000005e-05 | 24124997 | 28227509.768 | 32355026.274 |
| 2.80199500000005e-05 | 24071220.456 | 28163850.513 | 32281393.631 |
| 2.80371000000005e-05 | 24017593.083 | 28100370.078 | 32207969.838 |
| 2.80542500000005e-05 | 23964114.387 | 28037067.86 | 32134754.185 |
| 2.80714000000005e-05 | 23910783.876 | 27973943.262 | 32061745.967 |
| 2.80885500000005e-05 | 23857601.058 | 27910995.689 | 31988944.481 |
| 2.81057000000005e-05 | 23804565.447 | 27848224.546 | 31916349.026 |
| 2.81228500000005e-05 | 23751676.554 | 27785629.243 | 31843958.904 |
| 2.81400000000005e-05 | 23698933.896 | 27723209.191 | 31771773.422 |
| 2.81571500000005e-05 | 23646336.989 | 27660963.803 | 31699791.886 |
| 2.81743000000005e-05 | 23593885.353 | 27598892.495 | 31628013.608 |
| 2.81914500000005e-05 | 23541578.508 | 27536994.684 | 31556437.901 |
| 2.82086000000005e-05 | 23489415.977 | 27475269.792 | 31485064.081 |
| 2.82257500000005e-05 | 23437397.285 | 27413717.24 | 31413891.467 |
| 2.82429000000005e-05 | 23385521.957 | 27352336.453 | 31342919.38 |
| 2.82600500000005e-05 | 23333789.522 | 27291126.859 | 31272147.144 |
| 2.82772000000005e-05 | 23282199.51 | 27230087.886 | 31201574.086 |
| 2.82943500000005e-05 | 23230751.452 | 27169218.965 | 31131199.536 |
| 2.83115000000005e-05 | 23179444.882 | 27108519.532 | 31061022.825 |
| 2.83286500000005e-05 | 23128279.335 | 27047989.02 | 30991043.288 |
| 2.83458000000005e-05 | 23077254.348 | 26987626.869 | 30921260.262 |
| 2.83629500000005e-05 | 23026369.461 | 26927432.517 | 30851673.087 |
| 2.83801000000005e-05 | 22975624.213 | 26867405.409 | 30782281.105 |
| 2.83972500000005e-05 | 22925018.147 | 26807544.987 | 30713083.662 |
| 2.84144000000005e-05 | 22874550.807 | 26747850.7 | 30644080.105 |
| 2.84315500000005e-05 | 22824221.738 | 26688321.994 | 30575269.784 |
| 2.84487000000005e-05 | 22774030.489 | 26628958.322 | 30506652.051 |
| 2.84658500000005e-05 | 22723976.608 | 26569759.136 | 30438226.262 |
| 2.84830000000005e-05 | 22674059.647 | 26510723.892 | 30369991.774 |
| 2.85001500000005e-05 | 22624279.158 | 26451852.046 | 30301947.947 |
| 2.85173000000005e-05 | 22574634.695 | 26393143.058 | 30234094.145 |
| 2.85344500000005e-05 | 22525125.815 | 26334596.389 | 30166429.731 |
| 2.85516000000005e-05 | 22475752.075 | 26276211.502 | 30098954.074 |
| 2.85687500000005e-05 | 22426513.034 | 26217987.864 | 30031666.544 |
| 2.85859000000005e-05 | 22377408.254 | 26159924.941 | 29964566.513 |
| 2.86030500000005e-05 | 22328437.298 | 26102022.204 | 29897653.356 |
| 2.86202000000005e-05 | 22279599.729 | 26044279.123 | 29830926.45 |
| 2.86373500000005e-05 | 22230895.114 | 25986695.173 | 29764385.176 |
| 2.86545000000005e-05 | 22182323.02 | 25929269.829 | 29698028.914 |
| 2.86716500000005e-05 | 22133883.017 | 25872002.568 | 29631857.051 |
| 2.86888000000005e-05 | 22085574.675 | 25814892.871 | 29565868.972 |
| 2.87059500000005e-05 | 22037397.567 | 25757940.22 | 29500064.066 |
| 2.87231000000005e-05 | 21989351.268 | 25701144.097 | 29434441.727 |
| 2.87402500000005e-05 | 21941435.353 | 25644503.988 | 29369001.347 |
| 2.87574000000005e-05 | 21893649.399 | 25588019.381 | 29303742.323 |
| 2.87745500000005e-05 | 21845992.985 | 25531689.766 | 29238664.053 |
| 2.87917000000005e-05 | 21798465.692 | 25475514.633 | 29173765.939 |
| 2.88088500000005e-05 | 21751067.102 | 25419493.477 | 29109047.383 |
| 2.88260000000005e-05 | 21703796.799 | 25363625.793 | 29044507.792 |
| 2.88431500000005e-05 | 21656654.367 | 25307911.078 | 28980146.573 |
| 2.88603000000005e-05 | 21609639.394 | 25252348.831 | 28915963.137 |
| 2.88774500000005e-05 | 21562751.468 | 25196938.553 | 28851956.895 |
| 2.88946000000005e-05 | 21515990.178 | 25141679.747 | 28788127.263 |
| 2.89117500000005e-05 | 21469355.117 | 25086571.919 | 28724473.658 |
| 2.89289000000005e-05 | 21422845.877 | 25031614.574 | 28660995.498 |
| 2.89460500000005e-05 | 21376462.053 | 24976807.222 | 28597692.204 |
| 2.89632000000005e-05 | 21330203.24 | 24922149.373 | 28534563.202 |
| 2.89803500000005e-05 | 21284069.036 | 24867640.539 | 28471607.916 |
| 2.89975000000005e-05 | 21238059.04 | 24813280.235 | 28408825.774 |
| 2.90146500000005e-05 | 21192172.853 | 24759067.977 | 28346216.207 |
| 2.90318000000005e-05 | 21146410.077 | 24705003.281 | 28283778.647 |
| 2.90489500000005e-05 | 21100770.315 | 24651085.67 | 28221512.529 |
| 2.90661000000005e-05 | 21055253.172 | 24597314.662 | 28159417.289 |
| 2.90832500000005e-05 | 21009858.254 | 24543689.783 | 28097492.366 |
| 2.91004000000005e-05 | 20964585.169 | 24490210.557 | 28035737.201 |
| 2.91175500000005e-05 | 20919433.528 | 24436876.511 | 27974151.238 |
| 2.91347000000005e-05 | 20874402.94 | 24383687.174 | 27912733.922 |
| 2.91518500000005e-05 | 20829493.017 | 24330642.076 | 27851484.7 |
| 2.91690000000005e-05 | 20784703.375 | 24277740.75 | 27790403.021 |
| 2.91861500000005e-05 | 20740033.627 | 24224982.729 | 27729488.337 |
| 2.92033000000005e-05 | 20695483.39 | 24172367.55 | 27668740.103 |
| 2.92204500000005e-05 | 20651052.282 | 24119894.749 | 27608157.773 |
| 2.92376000000005e-05 | 20606739.923 | 24067563.867 | 27547740.805 |
| 2.92547500000005e-05 | 20562545.934 | 24015374.443 | 27487488.66 |
| 2.92719000000005e-05 | 20518469.936 | 23963326.022 | 27427400.8 |
| 2.92890500000005e-05 | 20474511.553 | 23911418.146 | 27367476.687 |
| 2.93062000000005e-05 | 20430670.411 | 23859650.363 | 27307715.789 |
| 2.93233500000005e-05 | 20386946.136 | 23808022.221 | 27248117.574 |
| 2.93405000000005e-05 | 20343338.355 | 23756533.268 | 27188681.511 |
| 2.93576500000005e-05 | 20299846.698 | 23705183.056 | 27129407.072 |
| 2.93748000000005e-05 | 20256470.795 | 23653971.138 | 27070293.732 |
| 2.93919500000005e-05 | 20213210.278 | 23602897.069 | 27011340.967 |
| 2.94091000000005e-05 | 20170064.781 | 23551960.405 | 26952548.255 |
| 2.94262500000005e-05 | 20127033.938 | 23501160.703 | 26893915.075 |
| 2.94434000000005e-05 | 20084117.384 | 23450497.524 | 26835440.911 |
| 2.94605500000005e-05 | 20041314.758 | 23399970.428 | 26777125.245 |
| 2.94777000000005e-05 | 19998625.698 | 23349578.979 | 26718967.563 |
| 2.94948500000005e-05 | 19956049.844 | 23299322.741 | 26660967.354 |
| 2.95120000000005e-05 | 19913586.838 | 23249201.28 | 26603124.108 |
| 2.95291500000005e-05 | 19871236.321 | 23199214.163 | 26545437.315 |
| 2.95463000000005e-05 | 19828997.938 | 23149360.961 | 26487906.469 |
| 2.95634500000005e-05 | 19786871.334 | 23099641.244 | 26430531.067 |
| 2.95806000000005e-05 | 19744856.155 | 23050054.584 | 26373310.605 |
| 2.95977500000005e-05 | 19702952.05 | 23000600.557 | 26316244.583 |
| 2.96149000000005e-05 | 19661158.668 | 22951278.736 | 26259332.502 |
| 2.96320500000005e-05 | 19619475.658 | 22902088.701 | 26202573.864 |
| 2.96492000000005e-05 | 19577902.673 | 22853030.029 | 26145968.176 |
| 2.96663500000005e-05 | 19536439.366 | 22804102.302 | 26089514.943 |
| 2.96835000000005e-05 | 19495085.391 | 22755305.1 | 26033213.675 |
| 2.97006500000005e-05 | 19453840.404 | 22706638.009 | 25977063.881 |
| 2.97178000000005e-05 | 19412704.06 | 22658100.612 | 25921065.074 |
| 2.97349500000005e-05 | 19371676.019 | 22609692.496 | 25865216.769 |
| 2.97521000000005e-05 | 19330755.939 | 22561413.25 | 25809518.48 |
| 2.97692500000005e-05 | 19289943.482 | 22513262.464 | 25753969.727 |
| 2.97864000000005e-05 | 19249238.308 | 22465239.728 | 25698570.028 |
| 2.98035500000005e-05 | 19208640.082 | 22417344.635 | 25643318.905 |
| 2.98207000000005e-05 | 19168148.466 | 22369576.78 | 25588215.881 |
| 2.98378500000005e-05 | 19127763.127 | 22321935.757 | 25533260.481 |
| 2.98550000000005e-05 | 19087483.731 | 22274421.165 | 25478452.231 |
| 2.98721500000005e-05 | 19047309.947 | 22227032.603 | 25423790.661 |
| 2.98893000000005e-05 | 19007241.442 | 22179769.669 | 25369275.299 |
| 2.99064500000005e-05 | 18967277.888 | 22132631.967 | 25314905.679 |
| 2.99236000000005e-05 | 18927418.956 | 22085619.098 | 25260681.334 |
| 2.99407500000005e-05 | 18887664.319 | 22038730.669 | 25206601.8 |
| 2.99579000000005e-05 | 18848013.651 | 21991966.284 | 25152666.613 |
| 2.99750500000005e-05 | 18808466.626 | 21945325.551 | 25098875.313 |
| 2.99922000000005e-05 | 18769022.921 | 21898808.079 | 25045227.44 |
| 3.00093500000005e-05 | 18729682.214 | 21852413.479 | 24991722.536 |
| 3.00265000000005e-05 | 18690444.182 | 21806141.362 | 24938360.146 |
| 3.00436500000005e-05 | 18651308.506 | 21759991.342 | 24885139.815 |
| 3.00608000000005e-05 | 18612274.867 | 21713963.033 | 24832061.091 |
| 3.00779500000005e-05 | 18573342.947 | 21668056.052 | 24779123.522 |
| 3.00951000000005e-05 | 18534512.428 | 21622270.015 | 24726326.66 |
| 3.01122500000005e-05 | 18495782.996 | 21576604.542 | 24673670.056 |
| 3.01294000000005e-05 | 18457154.336 | 21531059.253 | 24621153.266 |
| 3.01465500000005e-05 | 18418626.134 | 21485633.77 | 24568775.844 |
| 3.01637000000005e-05 | 18380198.079 | 21440327.715 | 24516537.348 |
| 3.01808500000005e-05 | 18341869.859 | 21395140.713 | 24464437.337 |
| 3.01980000000005e-05 | 18303641.164 | 21350072.391 | 24412475.372 |
| 3.02151500000005e-05 | 18265511.685 | 21305122.374 | 24360651.015 |
| 3.02323000000005e-05 | 18227481.115 | 21260290.292 | 24308963.829 |
| 3.02494500000005e-05 | 18189549.147 | 21215575.775 | 24257413.381 |
| 3.02666000000005e-05 | 18151715.475 | 21170978.453 | 24205999.236 |
| 3.02837500000005e-05 | 18113979.795 | 21126497.96 | 24154720.965 |
| 3.03009000000005e-05 | 18076341.804 | 21082133.929 | 24103578.137 |
| 3.03180500000005e-05 | 18038801.2 | 21037885.996 | 24052570.323 |
| 3.03352000000005e-05 | 18001357.681 | 20993753.796 | 24001697.099 |
| 3.03523500000005e-05 | 17964010.947 | 20949736.969 | 23950958.037 |
| 3.03695000000005e-05 | 17926760.7 | 20905835.153 | 23900352.716 |
| 3.03866500000005e-05 | 17889606.64 | 20862047.989 | 23849880.712 |
| 3.04038000000005e-05 | 17852548.472 | 20818375.118 | 23799541.606 |
| 3.04209500000005e-05 | 17815585.9 | 20774816.185 | 23749334.979 |
| 3.04381000000005e-05 | 17778718.629 | 20731370.832 | 23699260.413 |
| 3.04552500000005e-05 | 17741946.365 | 20688038.707 | 23649317.494 |
| 3.04724000000005e-05 | 17705268.816 | 20644819.455 | 23599505.805 |
| 3.04895500000005e-05 | 17668685.69 | 20601712.726 | 23549824.936 |
| 3.05067000000005e-05 | 17632196.697 | 20558718.169 | 23500274.474 |
| 3.05238500000005e-05 | 17595801.546 | 20515835.434 | 23450854.011 |
| 3.05410000000005e-05 | 17559499.95 | 20473064.174 | 23401563.137 |
| 3.05581500000005e-05 | 17523291.622 | 20430404.043 | 23352401.446 |
| 3.05753000000005e-05 | 17487176.274 | 20387854.694 | 23303368.532 |
| 3.05924500000005e-05 | 17451153.621 | 20345415.784 | 23254463.993 |
| 3.06096000000005e-05 | 17415223.38 | 20303086.969 | 23205687.426 |
| 3.06267500000005e-05 | 17379385.266 | 20260867.909 | 23157038.43 |
| 3.06439000000005e-05 | 17343638.997 | 20218758.262 | 23108516.605 |
| 3.06610500000005e-05 | 17307984.293 | 20176757.69 | 23060121.554 |
| 3.06782000000005e-05 | 17272420.872 | 20134865.854 | 23011852.88 |
| 3.06953500000005e-05 | 17236948.456 | 20093082.418 | 22963710.189 |
| 3.07125000000005e-05 | 17201566.765 | 20051407.046 | 22915693.086 |
| 3.07296500000005e-05 | 17166275.523 | 20009839.404 | 22867801.18 |
| 3.07468000000005e-05 | 17131074.453 | 19968379.159 | 22820034.08 |
| 3.07639500000005e-05 | 17095963.281 | 19927025.978 | 22772391.397 |
| 3.07811000000005e-05 | 17060941.73 | 19885779.532 | 22724872.742 |
| 3.07982500000005e-05 | 17026009.529 | 19844639.49 | 22677477.73 |
| 3.08154000000005e-05 | 16991166.404 | 19803605.524 | 22630205.974 |
| 3.08325500000005e-05 | 16956412.084 | 19762677.307 | 22583057.093 |
| 3.08497000000005e-05 | 16921746.299 | 19721854.514 | 22536030.702 |
| 3.08668500000005e-05 | 16887168.778 | 19681136.818 | 22489126.422 |
| 3.08840000000005e-05 | 16852679.254 | 19640523.896 | 22442343.872 |
| 3.09011500000005e-05 | 16818277.459 | 19600015.427 | 22395682.676 |
| 3.09183000000005e-05 | 16783963.125 | 19559611.088 | 22349142.455 |
| 3.09354500000005e-05 | 16749735.987 | 19519310.559 | 22302722.834 |
| 3.09526000000005e-05 | 16715595.781 | 19479113.521 | 22256423.44 |
| 3.09697500000005e-05 | 16681542.241 | 19439019.657 | 22210243.9 |
| 3.09869000000005e-05 | 16647575.106 | 19399028.649 | 22164183.842 |
| 3.10040500000005e-05 | 16613694.114 | 19359140.182 | 22118242.896 |
| 3.10212000000005e-05 | 16579899.002 | 19319353.941 | 22072420.694 |
| 3.10383500000005e-05 | 16546189.511 | 19279669.613 | 22026716.868 |
| 3.10555000000005e-05 | 16512565.382 | 19240086.886 | 21981131.052 |
| 3.10726500000005e-05 | 16479026.356 | 19200605.448 | 21935662.881 |
| 3.10898000000005e-05 | 16445572.175 | 19161224.989 | 21890311.993 |
| 3.11069500000005e-05 | 16412202.584 | 19121945.2 | 21845078.024 |
| 3.11241000000005e-05 | 16378917.326 | 19082765.774 | 21799960.614 |
| 3.11412500000005e-05 | 16345716.147 | 19043686.404 | 21754959.404 |
| 3.11584000000005e-05 | 16312598.792 | 19004706.783 | 21710074.036 |
| 3.11755500000005e-05 | 16279565.009 | 18965826.608 | 21665304.151 |
| 3.11927000000005e-05 | 16246614.546 | 18927045.574 | 21620649.396 |
| 3.12098500000005e-05 | 16213747.152 | 18888363.38 | 21576109.415 |
| 3.12270000000005e-05 | 16180962.575 | 18849779.724 | 21531683.854 |
| 3.12441500000005e-05 | 16148260.567 | 18811294.305 | 21487372.364 |
| 3.12613000000005e-05 | 16115640.879 | 18772906.825 | 21443174.592 |
| 3.12784500000005e-05 | 16083103.264 | 18734616.985 | 21399090.189 |
| 3.12956000000005e-05 | 16050647.473 | 18696424.488 | 21355118.808 |
| 3.13127500000005e-05 | 16018273.263 | 18658329.039 | 21311260.101 |
| 3.13299000000005e-05 | 15985980.386 | 18620330.341 | 21267513.724 |
| 3.13470500000005e-05 | 15953768.6 | 18582428.101 | 21223879.33 |
| 3.13642000000005e-05 | 15921637.66 | 18544622.027 | 21180356.578 |
| 3.13813500000005e-05 | 15889587.325 | 18506911.825 | 21136945.126 |
| 3.13985000000005e-05 | 15857617.351 | 18469297.206 | 21093644.632 |
| 3.14156500000005e-05 | 15825727.499 | 18431777.879 | 21050454.757 |
| 3.14328000000005e-05 | 15793917.529 | 18394353.556 | 21007375.164 |
| 3.14499500000005e-05 | 15762187.2 | 18357023.949 | 20964405.514 |
| 3.14671000000005e-05 | 15730536.276 | 18319788.771 | 20921545.472 |
| 3.14842500000005e-05 | 15698964.517 | 18282647.735 | 20878794.703 |
| 3.15014000000005e-05 | 15667471.688 | 18245600.559 | 20836152.875 |
| 3.15185500000005e-05 | 15636057.553 | 18208646.957 | 20793619.653 |
| 3.15357000000005e-05 | 15604721.876 | 18171786.647 | 20751194.708 |
| 3.15528500000005e-05 | 15573464.423 | 18135019.347 | 20708877.71 |
| 3.15700000000005e-05 | 15542284.962 | 18098344.776 | 20666668.329 |
| 3.15871500000005e-05 | 15511183.258 | 18061762.654 | 20624566.238 |
| 3.16043000000005e-05 | 15480159.08 | 18025272.704 | 20582571.11 |
| 3.16214500000005e-05 | 15449212.198 | 17988874.646 | 20540682.621 |
| 3.16386000000005e-05 | 15418342.381 | 17952568.204 | 20498900.446 |
| 3.16557500000005e-05 | 15387549.399 | 17916353.101 | 20457224.262 |
| 3.16729000000005e-05 | 15356833.025 | 17880229.064 | 20415653.747 |
| 3.16900500000005e-05 | 15326193.029 | 17844195.818 | 20374188.58 |
| 3.17072000000005e-05 | 15295629.185 | 17808253.09 | 20332828.443 |
| 3.17243500000005e-05 | 15265141.268 | 17772400.608 | 20291573.016 |
| 3.17415000000005e-05 | 15234729.05 | 17736638.101 | 20250421.981 |
| 3.17586500000005e-05 | 15204392.308 | 17700965.299 | 20209375.024 |
| 3.17758000000005e-05 | 15174130.817 | 17665381.932 | 20168431.828 |
| 3.17929500000005e-05 | 15143944.355 | 17629887.732 | 20127592.08 |
| 3.18101000000005e-05 | 15113832.698 | 17594482.432 | 20086855.467 |
| 3.18272500000005e-05 | 15083795.626 | 17559165.765 | 20046221.677 |
| 3.18444000000005e-05 | 15053832.918 | 17523937.467 | 20005690.399 |
| 3.18615500000005e-05 | 15023944.352 | 17488797.272 | 19965261.324 |
| 3.18787000000005e-05 | 14994129.711 | 17453744.916 | 19924934.143 |
| 3.18958500000005e-05 | 14964388.775 | 17418780.137 | 19884708.549 |
| 3.19130000000005e-05 | 14934721.327 | 17383902.674 | 19844584.236 |
| 3.19301500000005e-05 | 14905127.149 | 17349112.265 | 19804560.897 |
| 3.19473000000005e-05 | 14875606.025 | 17314408.65 | 19764638.229 |
| 3.19644500000005e-05 | 14846157.739 | 17279791.57 | 19724815.93 |
| 3.19816000000005e-05 | 14816782.077 | 17245260.768 | 19685093.696 |
| 3.19987500000005e-05 | 14787478.824 | 17210815.985 | 19645471.226 |
| 3.20159000000005e-05 | 14758247.767 | 17176456.965 | 19605948.222 |
| 3.20330500000005e-05 | 14729088.694 | 17142183.454 | 19566524.383 |
| 3.20502000000005e-05 | 14700001.392 | 17107995.195 | 19527199.412 |
| 3.20673500000005e-05 | 14670985.65 | 17073891.936 | 19487973.012 |
| 3.20845000000005e-05 | 14642041.258 | 17039873.423 | 19448844.888 |
| 3.21016500000005e-05 | 14613168.005 | 17005939.405 | 19409814.744 |
| 3.21188000000005e-05 | 14584365.683 | 16972089.631 | 19370882.287 |
| 3.21359500000005e-05 | 14555634.084 | 16938323.849 | 19332047.224 |
| 3.21531000000005e-05 | 14526972.999 | 16904641.812 | 19293309.264 |
| 3.21702500000005e-05 | 14498382.223 | 16871043.269 | 19254668.115 |
| 3.21874000000005e-05 | 14469861.548 | 16837527.975 | 19216123.489 |
| 3.22045500000005e-05 | 14441410.769 | 16804095.681 | 19177675.096 |
| 3.22217000000005e-05 | 14413029.681 | 16770746.142 | 19139322.649 |
| 3.22388500000005e-05 | 14384718.08 | 16737479.112 | 19101065.861 |
| 3.22560000000005e-05 | 14356475.764 | 16704294.348 | 19062904.447 |
| 3.22731500000005e-05 | 14328302.528 | 16671191.606 | 19024838.121 |
| 3.22903000000005e-05 | 14300198.171 | 16638170.644 | 18986866.601 |
| 3.23074500000005e-05 | 14272162.492 | 16605231.219 | 18948989.604 |
| 3.23246000000005e-05 | 14244195.289 | 16572373.091 | 18911206.847 |
| 3.23417500000005e-05 | 14216296.364 | 16539596.02 | 18873518.05 |
| 3.23589000000005e-05 | 14188465.516 | 16506899.766 | 18835922.934 |
| 3.23760500000005e-05 | 14160702.547 | 16474284.091 | 18798421.22 |
| 3.23932000000005e-05 | 14133007.259 | 16441748.757 | 18761012.629 |
| 3.24103500000005e-05 | 14105379.454 | 16409293.527 | 18723696.885 |
| 3.24275000000005e-05 | 14077818.937 | 16376918.166 | 18686473.712 |
| 3.24446500000005e-05 | 14050325.511 | 16344622.439 | 18649342.836 |
| 3.24618000000005e-05 | 14022898.98 | 16312406.11 | 18612303.981 |
| 3.24789500000005e-05 | 13995539.151 | 16280268.947 | 18575356.876 |
| 3.24961000000005e-05 | 13968245.829 | 16248210.716 | 18538501.248 |
| 3.25132500000005e-05 | 13941018.821 | 16216231.185 | 18501736.825 |
| 3.25304000000005e-05 | 13913857.934 | 16184330.124 | 18465063.338 |
| 3.25475500000005e-05 | 13886762.976 | 16152507.302 | 18428480.518 |
| 3.25647000000005e-05 | 13859733.756 | 16120762.489 | 18391988.095 |
| 3.25818500000005e-05 | 13832770.083 | 16089095.456 | 18355585.803 |
| 3.25990000000005e-05 | 13805871.767 | 16057505.976 | 18319273.375 |
| 3.26161500000005e-05 | 13779038.618 | 16025993.821 | 18283050.545 |
| 3.26333000000005e-05 | 13752270.448 | 15994558.764 | 18246917.049 |
| 3.26504500000005e-05 | 13725567.069 | 15963200.581 | 18210872.623 |
| 3.26676000000005e-05 | 13698928.293 | 15931919.045 | 18174917.004 |
| 3.26847500000005e-05 | 13672353.933 | 15900713.933 | 18139049.93 |
| 3.27019000000005e-05 | 13645843.802 | 15869585.021 | 18103271.14 |
| 3.27190500000005e-05 | 13619397.716 | 15838532.087 | 18067580.374 |
| 3.27362000000005e-05 | 13593015.489 | 15807554.908 | 18031977.373 |
| 3.27533500000005e-05 | 13566696.937 | 15776653.264 | 17996461.878 |
| 3.27705000000005e-05 | 13540441.876 | 15745826.934 | 17961033.631 |
| 3.27876500000005e-05 | 13514250.123 | 15715075.699 | 17925692.377 |
| 3.28048000000005e-05 | 13488121.495 | 15684399.339 | 17890437.858 |
| 3.28219500000005e-05 | 13462055.81 | 15653797.636 | 17855269.822 |
| 3.28391000000005e-05 | 13436052.887 | 15623270.373 | 17820188.012 |
| 3.28562500000005e-05 | 13410112.546 | 15592817.333 | 17785192.177 |
| 3.28734000000005e-05 | 13384234.606 | 15562438.301 | 17750282.064 |
| 3.28905500000005e-05 | 13358418.887 | 15532133.06 | 17715457.422 |
| 3.29077000000005e-05 | 13332665.211 | 15501901.397 | 17680718 |
| 3.29248500000006e-05 | 13306973.399 | 15471743.098 | 17646063.548 |
| 3.29420000000006e-05 | 13281343.274 | 15441657.949 | 17611493.818 |
| 3.29591500000005e-05 | 13255774.659 | 15411645.738 | 17577008.561 |
| 3.29763000000005e-05 | 13230267.377 | 15381706.254 | 17542607.53 |
| 3.29934500000006e-05 | 13204821.251 | 15351839.286 | 17508290.48 |
| 3.30106000000006e-05 | 13179436.108 | 15322044.624 | 17474057.165 |
| 3.30277500000006e-05 | 13154111.771 | 15292322.057 | 17439907.339 |
| 3.30449000000006e-05 | 13128848.067 | 15262671.378 | 17405840.76 |
| 3.30620500000006e-05 | 13103644.822 | 15233092.378 | 17371857.184 |
| 3.30792000000006e-05 | 13078501.863 | 15203584.85 | 17337956.369 |
| 3.30963500000006e-05 | 13053419.017 | 15174148.587 | 17304138.074 |
| 3.31135000000006e-05 | 13028396.114 | 15144783.383 | 17270402.058 |
| 3.31306500000006e-05 | 13003432.98 | 15115489.033 | 17236748.081 |
| 3.31478000000006e-05 | 12978529.447 | 15086265.332 | 17203175.906 |
| 3.31649500000006e-05 | 12953685.343 | 15057112.077 | 17169685.293 |
| 3.31821000000006e-05 | 12928900.498 | 15028029.063 | 17136276.005 |
| 3.31992500000006e-05 | 12904174.745 | 14999016.089 | 17102947.806 |
| 3.32164000000006e-05 | 12879507.913 | 14970072.953 | 17069700.461 |
| 3.32335500000006e-05 | 12854899.836 | 14941199.454 | 17036533.734 |
| 3.32507000000006e-05 | 12830350.346 | 14912395.39 | 17003447.392 |
| 3.32678500000006e-05 | 12805859.277 | 14883660.563 | 16970441.2 |
| 3.32850000000006e-05 | 12781426.461 | 14854994.772 | 16937514.927 |
| 3.33021500000006e-05 | 12757051.733 | 14826397.82 | 16904668.341 |
| 3.33193000000006e-05 | 12732734.928 | 14797869.508 | 16871901.211 |
| 3.33364500000006e-05 | 12708475.882 | 14769409.64 | 16839213.307 |
| 3.33536000000006e-05 | 12684274.429 | 14741018.019 | 16806604.399 |
| 3.33707500000006e-05 | 12660130.408 | 14712694.449 | 16774074.259 |
| 3.33879000000006e-05 | 12636043.654 | 14684438.735 | 16741622.659 |
| 3.34050500000006e-05 | 12612014.006 | 14656250.682 | 16709249.372 |
| 3.34222000000006e-05 | 12588041.301 | 14628130.096 | 16676954.172 |
| 3.34393500000006e-05 | 12564125.378 | 14600076.784 | 16644736.833 |
| 3.34565000000006e-05 | 12540266.076 | 14572090.554 | 16612597.13 |
| 3.34736500000006e-05 | 12516463.234 | 14544171.213 | 16580534.84 |
| 3.34908000000006e-05 | 12492716.694 | 14516318.57 | 16548549.739 |
| 3.35079500000006e-05 | 12469026.295 | 14488532.435 | 16516641.605 |
| 3.35251000000006e-05 | 12445391.879 | 14460812.617 | 16484810.215 |
| 3.35422500000006e-05 | 12421813.288 | 14433158.927 | 16453055.349 |
| 3.35594000000006e-05 | 12398290.364 | 14405571.175 | 16421376.787 |
| 3.35765500000006e-05 | 12374822.949 | 14378049.175 | 16389774.309 |
| 3.35937000000006e-05 | 12351410.888 | 14350592.739 | 16358247.696 |
| 3.36108500000006e-05 | 12328054.024 | 14323201.678 | 16326796.73 |
| 3.36280000000006e-05 | 12304752.201 | 14295875.808 | 16295421.194 |
| 3.36451500000006e-05 | 12281505.264 | 14268614.942 | 16264120.871 |
| 3.36623000000006e-05 | 12258313.058 | 14241418.895 | 16232895.545 |
| 3.36794500000006e-05 | 12235175.43 | 14214287.483 | 16201745.001 |
| 3.36966000000006e-05 | 12212092.225 | 14187220.523 | 16170669.025 |
| 3.37137500000006e-05 | 12189063.292 | 14160217.83 | 16139667.403 |
| 3.37309000000006e-05 | 12166088.476 | 14133279.222 | 16108739.922 |
| 3.37480500000006e-05 | 12143167.626 | 14106404.517 | 16077886.369 |
| 3.37652000000006e-05 | 12120300.59 | 14079593.533 | 16047106.533 |
| 3.37823500000006e-05 | 12097487.218 | 14052846.091 | 16016400.203 |
| 3.37995000000006e-05 | 12074727.358 | 14026162.009 | 15985767.169 |
| 3.38166500000006e-05 | 12052020.86 | 13999541.108 | 15955207.222 |
| 3.38338000000006e-05 | 12029367.575 | 13972983.208 | 15924720.152 |
| 3.38509500000006e-05 | 12006767.354 | 13946488.132 | 15894305.751 |
| 3.38681000000006e-05 | 11984220.047 | 13920055.702 | 15863963.812 |
| 3.38852500000006e-05 | 11961725.507 | 13893685.739 | 15833694.129 |
| 3.39024000000006e-05 | 11939283.586 | 13867378.069 | 15803496.495 |
| 3.39195500000006e-05 | 11916894.137 | 13841132.513 | 15773370.704 |
| 3.39367000000006e-05 | 11894557.013 | 13814948.898 | 15743316.553 |
| 3.39538500000006e-05 | 11872272.067 | 13788827.047 | 15713333.837 |
| 3.39710000000006e-05 | 11850039.155 | 13762766.787 | 15683422.353 |
| 3.39881500000006e-05 | 11827858.13 | 13736767.943 | 15653581.898 |
| 3.40053000000006e-05 | 11805728.847 | 13710830.343 | 15623812.271 |
| 3.40224500000006e-05 | 11783651.163 | 13684953.813 | 15594113.269 |
| 3.40396000000006e-05 | 11761624.934 | 13659138.182 | 15564484.693 |
| 3.40567500000006e-05 | 11739650.015 | 13633383.278 | 15534926.342 |
| 3.40739000000006e-05 | 11717726.264 | 13607688.931 | 15505438.017 |
| 3.40910500000006e-05 | 11695853.539 | 13582054.968 | 15476019.519 |
| 3.41082000000006e-05 | 11674031.697 | 13556481.222 | 15446670.65 |
| 3.41253500000006e-05 | 11652260.597 | 13530967.522 | 15417391.214 |
| 3.41425000000006e-05 | 11630540.098 | 13505513.7 | 15388181.013 |
| 3.41596500000006e-05 | 11608870.059 | 13480119.587 | 15359039.851 |
| 3.41768000000006e-05 | 11587250.339 | 13454785.016 | 15329967.533 |
| 3.41939500000006e-05 | 11565680.8 | 13429509.82 | 15300963.864 |
| 3.42111000000006e-05 | 11544161.301 | 13404293.832 | 15272028.65 |
| 3.42282500000006e-05 | 11522691.704 | 13379136.886 | 15243161.698 |
| 3.42454000000006e-05 | 11501271.87 | 13354038.817 | 15214362.814 |
| 3.42625500000006e-05 | 11479901.661 | 13328999.459 | 15185631.806 |
| 3.42797000000006e-05 | 11458580.941 | 13304018.649 | 15156968.484 |
| 3.42968500000006e-05 | 11437309.571 | 13279096.222 | 15128372.655 |
| 3.43140000000006e-05 | 11416087.415 | 13254232.016 | 15099844.13 |
| 3.43311500000006e-05 | 11394914.337 | 13229425.867 | 15071382.719 |
| 3.43483000000006e-05 | 11373790.202 | 13204677.612 | 15042988.233 |
| 3.43654500000006e-05 | 11352714.873 | 13179987.091 | 15014660.483 |
| 3.43826000000006e-05 | 11331688.215 | 13155354.143 | 14986399.281 |
| 3.43997500000006e-05 | 11310710.096 | 13130778.605 | 14958204.441 |
| 3.44169000000006e-05 | 11289780.379 | 13106260.319 | 14930075.776 |
| 3.44340500000006e-05 | 11268898.933 | 13081799.125 | 14902013.099 |
| 3.44512000000006e-05 | 11248065.623 | 13057394.863 | 14874016.225 |
| 3.44683500000006e-05 | 11227280.317 | 13033047.374 | 14846084.971 |
| 3.44855000000006e-05 | 11206542.882 | 13008756.502 | 14818219.15 |
| 3.45026500000006e-05 | 11185853.187 | 12984522.087 | 14790418.58 |
| 3.45198000000006e-05 | 11165211.101 | 12960343.974 | 14762683.078 |
| 3.45369500000006e-05 | 11144616.491 | 12936222.005 | 14735012.462 |
| 3.45541000000006e-05 | 11124069.228 | 12912156.025 | 14707406.549 |
| 3.45712500000006e-05 | 11103569.181 | 12888145.877 | 14679865.159 |
| 3.45884000000006e-05 | 11083116.22 | 12864191.408 | 14652388.11 |
| 3.46055500000006e-05 | 11062710.217 | 12840292.461 | 14624975.224 |
| 3.46227000000006e-05 | 11042351.041 | 12816448.884 | 14597626.32 |
| 3.46398500000006e-05 | 11022038.565 | 12792660.522 | 14570341.219 |
| 3.46570000000006e-05 | 11001772.661 | 12768927.223 | 14543119.744 |
| 3.46741500000006e-05 | 10981553.2 | 12745248.834 | 14515961.716 |
| 3.46913000000006e-05 | 10961380.055 | 12721625.203 | 14488866.959 |
| 3.47084500000006e-05 | 10941253.1 | 12698056.179 | 14461835.296 |
| 3.47256000000006e-05 | 10921172.208 | 12674541.609 | 14434866.552 |
| 3.47427500000006e-05 | 10901137.252 | 12651081.344 | 14407960.549 |
| 3.47599000000006e-05 | 10881148.107 | 12627675.234 | 14381117.115 |
| 3.47770500000006e-05 | 10861204.649 | 12604323.129 | 14354336.074 |
| 3.47942000000006e-05 | 10841306.75 | 12581024.879 | 14327617.254 |
| 3.48113500000006e-05 | 10821454.288 | 12557780.336 | 14300960.48 |
| 3.48285000000006e-05 | 10801647.139 | 12534589.352 | 14274365.58 |
| 3.48456500000006e-05 | 10781885.177 | 12511451.779 | 14247832.383 |
| 3.48628000000006e-05 | 10762168.281 | 12488367.47 | 14221360.717 |
| 3.48799500000006e-05 | 10742496.327 | 12465336.278 | 14194950.41 |
| 3.48971000000006e-05 | 10722869.192 | 12442358.057 | 14168601.294 |
| 3.49142500000006e-05 | 10703286.755 | 12419432.66 | 14142313.197 |
| 3.49314000000006e-05 | 10683748.893 | 12396559.944 | 14116085.95 |
| 3.49485500000006e-05 | 10664255.486 | 12373739.761 | 14089919.386 |
| 3.49657000000006e-05 | 10644806.411 | 12350971.969 | 14063813.336 |
| 3.49828500000006e-05 | 10625401.55 | 12328256.423 | 14037767.631 |
| 3.50000000000006e-05 | 10606040.78 | 12305592.98 | 14011782.106 |